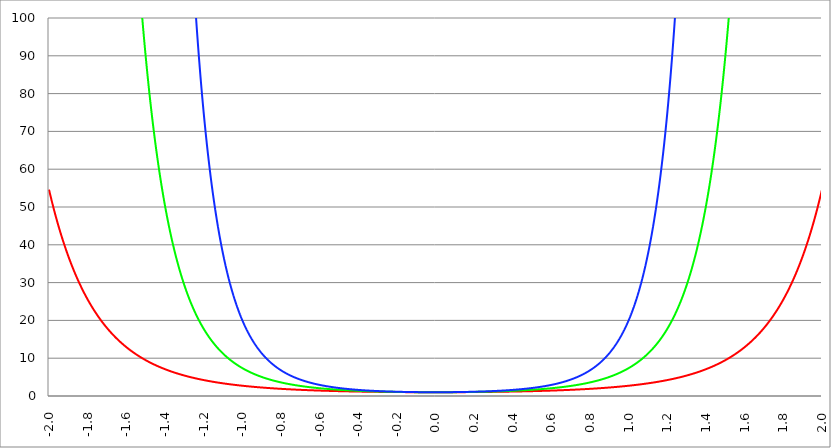
| Category | Series 1 | Series 0 | Series 2 |
|---|---|---|---|
| -2.0 | 54.598 | 2980.958 | 162754.791 |
| -1.998 | 54.163 | 2933.666 | 158897.084 |
| -1.996 | 53.732 | 2887.17 | 155134.537 |
| -1.994 | 53.305 | 2841.456 | 151464.719 |
| -1.992 | 52.882 | 2796.511 | 147885.263 |
| -1.99 | 52.463 | 2752.321 | 144393.862 |
| -1.988 | 52.047 | 2708.873 | 140988.274 |
| -1.986 | 51.635 | 2666.153 | 137666.311 |
| -1.984 | 51.226 | 2624.149 | 134425.847 |
| -1.982 | 50.822 | 2582.848 | 131264.808 |
| -1.98 | 50.421 | 2542.238 | 128181.179 |
| -1.978 | 50.023 | 2502.306 | 125172.993 |
| -1.976 | 49.629 | 2463.041 | 122238.337 |
| -1.974 | 49.239 | 2424.431 | 119375.349 |
| -1.972 | 48.851 | 2386.464 | 116582.214 |
| -1.97 | 48.468 | 2349.129 | 113857.165 |
| -1.968 | 48.088 | 2312.416 | 111198.481 |
| -1.966 | 47.711 | 2276.312 | 108604.487 |
| -1.964 | 47.337 | 2240.808 | 106073.55 |
| -1.962 | 46.967 | 2205.894 | 103604.081 |
| -1.96 | 46.6 | 2171.558 | 101194.532 |
| -1.958 | 46.236 | 2137.79 | 98843.394 |
| -1.956 | 45.876 | 2104.582 | 96549.2 |
| -1.954 | 45.518 | 2071.922 | 94310.518 |
| -1.952 | 45.164 | 2039.802 | 92125.955 |
| -1.95 | 44.813 | 2008.212 | 89994.155 |
| -1.948 | 44.465 | 1977.143 | 87913.794 |
| -1.946 | 44.12 | 1946.585 | 85883.585 |
| -1.944 | 43.778 | 1916.531 | 83902.274 |
| -1.942 | 43.439 | 1886.971 | 81968.639 |
| -1.94 | 43.103 | 1857.896 | 80081.488 |
| -1.938 | 42.77 | 1829.299 | 78239.663 |
| -1.936 | 42.44 | 1801.17 | 76442.033 |
| -1.934 | 42.113 | 1773.503 | 74687.498 |
| -1.932 | 41.789 | 1746.289 | 72974.986 |
| -1.93 | 41.467 | 1719.519 | 71303.451 |
| -1.928 | 41.148 | 1693.187 | 69671.875 |
| -1.926 | 40.832 | 1667.285 | 68079.267 |
| -1.924 | 40.519 | 1641.806 | 66524.661 |
| -1.922 | 40.209 | 1616.742 | 65007.115 |
| -1.92 | 39.901 | 1592.085 | 63525.711 |
| -1.918 | 39.596 | 1567.83 | 62079.556 |
| -1.916 | 39.293 | 1543.97 | 60667.778 |
| -1.914 | 38.994 | 1520.496 | 59289.529 |
| -1.912 | 38.696 | 1497.404 | 57943.982 |
| -1.91 | 38.402 | 1474.685 | 56630.331 |
| -1.908 | 38.11 | 1452.335 | 55347.789 |
| -1.906 | 37.82 | 1430.346 | 54095.593 |
| -1.904 | 37.533 | 1408.713 | 52872.995 |
| -1.902 | 37.248 | 1387.429 | 51679.269 |
| -1.9 | 36.966 | 1366.489 | 50513.707 |
| -1.898 | 36.686 | 1345.886 | 49375.617 |
| -1.896 | 36.409 | 1325.615 | 48264.327 |
| -1.894 | 36.134 | 1305.671 | 47179.181 |
| -1.892 | 35.861 | 1286.046 | 46119.54 |
| -1.89 | 35.591 | 1266.738 | 45084.78 |
| -1.888 | 35.323 | 1247.739 | 44074.294 |
| -1.886 | 35.058 | 1229.044 | 43087.491 |
| -1.884 | 34.794 | 1210.649 | 42123.792 |
| -1.882 | 34.533 | 1192.549 | 41182.636 |
| -1.88 | 34.274 | 1174.738 | 40263.475 |
| -1.878 | 34.018 | 1157.211 | 39365.773 |
| -1.876 | 33.763 | 1139.964 | 38489.009 |
| -1.874 | 33.511 | 1122.992 | 37632.676 |
| -1.872 | 33.261 | 1106.291 | 36796.279 |
| -1.87 | 33.013 | 1089.855 | 35979.334 |
| -1.868 | 32.767 | 1073.681 | 35181.371 |
| -1.866 | 32.523 | 1057.763 | 34401.932 |
| -1.864 | 32.282 | 1042.099 | 33640.568 |
| -1.862 | 32.042 | 1026.682 | 32896.844 |
| -1.86 | 31.804 | 1011.51 | 32170.334 |
| -1.858 | 31.569 | 996.579 | 31460.624 |
| -1.856 | 31.335 | 981.883 | 30767.309 |
| -1.854 | 31.103 | 967.419 | 30089.995 |
| -1.852 | 30.874 | 953.184 | 29428.298 |
| -1.85 | 30.646 | 939.173 | 28781.843 |
| -1.848 | 30.42 | 925.383 | 28150.264 |
| -1.846 | 30.196 | 911.81 | 27533.205 |
| -1.844 | 29.974 | 898.451 | 26930.318 |
| -1.842 | 29.754 | 885.301 | 26341.265 |
| -1.84 | 29.536 | 872.358 | 25765.715 |
| -1.838 | 29.319 | 859.618 | 25203.345 |
| -1.836 | 29.105 | 847.077 | 24653.841 |
| -1.834 | 28.892 | 834.733 | 24116.897 |
| -1.832 | 28.681 | 822.582 | 23592.213 |
| -1.83 | 28.471 | 810.62 | 23079.499 |
| -1.828 | 28.264 | 798.846 | 22578.468 |
| -1.826 | 28.058 | 787.255 | 22088.845 |
| -1.824 | 27.854 | 775.844 | 21610.358 |
| -1.822 | 27.652 | 764.612 | 21142.743 |
| -1.82 | 27.451 | 753.553 | 20685.743 |
| -1.818 | 27.252 | 742.667 | 20239.107 |
| -1.816 | 27.055 | 731.95 | 19802.59 |
| -1.814 | 26.859 | 721.399 | 19375.952 |
| -1.812 | 26.665 | 711.011 | 18958.961 |
| -1.81 | 26.472 | 700.784 | 18551.39 |
| -1.808 | 26.281 | 690.715 | 18153.016 |
| -1.806 | 26.092 | 680.802 | 17763.623 |
| -1.804 | 25.904 | 671.042 | 17383 |
| -1.802 | 25.718 | 661.433 | 17010.941 |
| -1.8 | 25.534 | 651.971 | 16647.245 |
| -1.798 | 25.351 | 642.655 | 16291.715 |
| -1.796 | 25.169 | 633.482 | 15944.162 |
| -1.794 | 24.989 | 624.45 | 15604.397 |
| -1.792 | 24.81 | 615.557 | 15272.239 |
| -1.79 | 24.633 | 606.8 | 14947.51 |
| -1.788 | 24.458 | 598.178 | 14630.037 |
| -1.786 | 24.283 | 589.687 | 14319.65 |
| -1.784 | 24.111 | 581.326 | 14016.185 |
| -1.782 | 23.939 | 573.093 | 13719.48 |
| -1.78 | 23.769 | 564.985 | 13429.378 |
| -1.778 | 23.601 | 557.002 | 13145.726 |
| -1.776 | 23.434 | 549.139 | 12868.375 |
| -1.774 | 23.268 | 541.397 | 12597.177 |
| -1.772 | 23.103 | 533.772 | 12331.99 |
| -1.77 | 22.94 | 526.262 | 12072.676 |
| -1.768 | 22.779 | 518.867 | 11819.098 |
| -1.766 | 22.618 | 511.584 | 11571.124 |
| -1.764 | 22.459 | 504.411 | 11328.625 |
| -1.762 | 22.301 | 497.347 | 11091.474 |
| -1.76 | 22.145 | 490.39 | 10859.548 |
| -1.758 | 21.989 | 483.537 | 10632.727 |
| -1.756 | 21.835 | 476.788 | 10410.894 |
| -1.754 | 21.683 | 470.141 | 10193.933 |
| -1.752 | 21.531 | 463.593 | 9981.733 |
| -1.75 | 21.381 | 457.145 | 9774.185 |
| -1.748 | 21.232 | 450.793 | 9571.182 |
| -1.746 | 21.084 | 444.536 | 9372.62 |
| -1.744 | 20.937 | 438.374 | 9178.398 |
| -1.742 | 20.792 | 432.304 | 8988.417 |
| -1.74 | 20.648 | 426.324 | 8802.579 |
| -1.738 | 20.504 | 420.434 | 8620.79 |
| -1.736 | 20.363 | 414.632 | 8442.958 |
| -1.734 | 20.222 | 408.917 | 8268.993 |
| -1.732 | 20.082 | 403.287 | 8098.807 |
| -1.73 | 19.943 | 397.741 | 7932.313 |
| -1.728 | 19.806 | 392.277 | 7769.429 |
| -1.726 | 19.67 | 386.894 | 7610.073 |
| -1.724 | 19.534 | 381.592 | 7454.163 |
| -1.722 | 19.4 | 376.368 | 7301.624 |
| -1.72 | 19.267 | 371.222 | 7152.377 |
| -1.718 | 19.135 | 366.152 | 7006.349 |
| -1.716 | 19.004 | 361.157 | 6863.467 |
| -1.714 | 18.874 | 356.235 | 6723.66 |
| -1.712 | 18.745 | 351.387 | 6586.86 |
| -1.71 | 18.617 | 346.61 | 6452.997 |
| -1.708 | 18.491 | 341.903 | 6322.007 |
| -1.706 | 18.365 | 337.266 | 6193.824 |
| -1.704 | 18.24 | 332.697 | 6068.386 |
| -1.702 | 18.116 | 328.195 | 5945.631 |
| -1.7 | 17.993 | 323.759 | 5825.499 |
| -1.698 | 17.871 | 319.388 | 5707.932 |
| -1.696 | 17.751 | 315.082 | 5592.871 |
| -1.694 | 17.631 | 310.838 | 5480.261 |
| -1.692 | 17.512 | 306.656 | 5370.047 |
| -1.69 | 17.394 | 302.536 | 5262.176 |
| -1.688 | 17.276 | 298.476 | 5156.596 |
| -1.686 | 17.16 | 294.474 | 5053.256 |
| -1.684 | 17.045 | 290.531 | 4952.105 |
| -1.682 | 16.931 | 286.646 | 4853.095 |
| -1.68 | 16.817 | 282.817 | 4756.18 |
| -1.678 | 16.705 | 279.044 | 4661.311 |
| -1.676 | 16.593 | 275.325 | 4568.444 |
| -1.674 | 16.482 | 271.66 | 4477.535 |
| -1.672 | 16.372 | 268.049 | 4388.541 |
| -1.67 | 16.263 | 264.489 | 4301.418 |
| -1.668 | 16.155 | 260.981 | 4216.126 |
| -1.666 | 16.048 | 257.524 | 4132.625 |
| -1.664 | 15.941 | 254.116 | 4050.874 |
| -1.662 | 15.835 | 250.758 | 3970.836 |
| -1.66 | 15.73 | 247.448 | 3892.473 |
| -1.658 | 15.626 | 244.185 | 3815.748 |
| -1.656 | 15.523 | 240.97 | 3740.625 |
| -1.654 | 15.421 | 237.8 | 3667.069 |
| -1.652 | 15.319 | 234.677 | 3595.046 |
| -1.65 | 15.218 | 231.597 | 3524.522 |
| -1.648 | 15.118 | 228.562 | 3455.464 |
| -1.646 | 15.019 | 225.57 | 3387.841 |
| -1.644 | 14.92 | 222.621 | 3321.62 |
| -1.642 | 14.823 | 219.714 | 3256.773 |
| -1.64 | 14.726 | 216.849 | 3193.268 |
| -1.638 | 14.63 | 214.024 | 3131.076 |
| -1.636 | 14.534 | 211.239 | 3070.169 |
| -1.634 | 14.439 | 208.494 | 3010.52 |
| -1.632 | 14.345 | 205.788 | 2952.1 |
| -1.63 | 14.252 | 203.121 | 2894.883 |
| -1.628 | 14.159 | 200.491 | 2838.843 |
| -1.626 | 14.068 | 197.898 | 2783.955 |
| -1.624 | 13.976 | 195.342 | 2730.194 |
| -1.622 | 13.886 | 192.822 | 2677.535 |
| -1.62 | 13.796 | 190.338 | 2625.955 |
| -1.618 | 13.707 | 187.888 | 2575.431 |
| -1.616 | 13.619 | 185.473 | 2525.939 |
| -1.614 | 13.531 | 183.093 | 2477.457 |
| -1.612 | 13.444 | 180.745 | 2429.965 |
| -1.61 | 13.358 | 178.431 | 2383.44 |
| -1.608 | 13.272 | 176.149 | 2337.862 |
| -1.606 | 13.187 | 173.899 | 2293.21 |
| -1.604 | 13.103 | 171.68 | 2249.466 |
| -1.602 | 13.019 | 169.492 | 2206.608 |
| -1.6 | 12.936 | 167.335 | 2164.62 |
| -1.598 | 12.853 | 165.208 | 2123.481 |
| -1.596 | 12.771 | 163.111 | 2083.174 |
| -1.594 | 12.69 | 161.043 | 2043.681 |
| -1.592 | 12.61 | 159.004 | 2004.985 |
| -1.59 | 12.53 | 156.993 | 1967.069 |
| -1.588 | 12.45 | 155.01 | 1929.916 |
| -1.586 | 12.372 | 153.054 | 1893.511 |
| -1.584 | 12.293 | 151.126 | 1857.837 |
| -1.582 | 12.216 | 149.224 | 1822.878 |
| -1.58 | 12.139 | 147.348 | 1788.621 |
| -1.578 | 12.062 | 145.499 | 1755.049 |
| -1.576 | 11.986 | 143.675 | 1722.149 |
| -1.574 | 11.911 | 141.876 | 1689.906 |
| -1.572 | 11.836 | 140.102 | 1658.306 |
| -1.57 | 11.762 | 138.352 | 1627.337 |
| -1.568 | 11.689 | 136.626 | 1596.984 |
| -1.566 | 11.616 | 134.924 | 1567.235 |
| -1.564 | 11.543 | 133.245 | 1538.077 |
| -1.562 | 11.471 | 131.59 | 1509.497 |
| -1.56 | 11.4 | 129.957 | 1481.485 |
| -1.558 | 11.329 | 128.346 | 1454.027 |
| -1.556 | 11.259 | 126.757 | 1427.112 |
| -1.554 | 11.189 | 125.19 | 1400.729 |
| -1.552 | 11.12 | 123.644 | 1374.867 |
| -1.55 | 11.051 | 122.119 | 1349.514 |
| -1.548 | 10.983 | 120.616 | 1324.661 |
| -1.546 | 10.915 | 119.132 | 1300.297 |
| -1.544 | 10.848 | 117.669 | 1276.412 |
| -1.542 | 10.781 | 116.225 | 1252.995 |
| -1.54 | 10.715 | 114.801 | 1230.038 |
| -1.538 | 10.649 | 113.396 | 1207.53 |
| -1.536 | 10.583 | 112.01 | 1185.462 |
| -1.534 | 10.519 | 110.643 | 1163.826 |
| -1.532 | 10.454 | 109.295 | 1142.612 |
| -1.53 | 10.391 | 107.964 | 1121.811 |
| -1.528 | 10.327 | 106.652 | 1101.416 |
| -1.526 | 10.264 | 105.357 | 1081.418 |
| -1.524 | 10.202 | 104.079 | 1061.808 |
| -1.522 | 10.14 | 102.819 | 1042.578 |
| -1.52 | 10.078 | 101.575 | 1023.722 |
| -1.518 | 10.017 | 100.348 | 1005.23 |
| -1.516 | 9.957 | 99.138 | 987.097 |
| -1.514 | 9.897 | 97.944 | 969.313 |
| -1.512 | 9.837 | 96.765 | 951.873 |
| -1.51 | 9.778 | 95.603 | 934.77 |
| -1.508 | 9.719 | 94.455 | 917.995 |
| -1.506 | 9.66 | 93.324 | 901.543 |
| -1.504 | 9.602 | 92.207 | 885.408 |
| -1.502 | 9.545 | 91.105 | 869.581 |
| -1.5 | 9.488 | 90.017 | 854.059 |
| -1.498 | 9.431 | 88.944 | 838.833 |
| -1.496 | 9.375 | 87.885 | 823.899 |
| -1.494 | 9.319 | 86.84 | 809.25 |
| -1.492 | 9.263 | 85.809 | 794.881 |
| -1.49 | 9.208 | 84.792 | 780.785 |
| -1.488 | 9.154 | 83.788 | 766.958 |
| -1.486 | 9.099 | 82.797 | 753.394 |
| -1.484 | 9.045 | 81.819 | 740.087 |
| -1.482 | 8.992 | 80.854 | 727.033 |
| -1.48 | 8.939 | 79.902 | 714.226 |
| -1.478 | 8.886 | 78.962 | 701.662 |
| -1.476 | 8.834 | 78.035 | 689.335 |
| -1.474 | 8.782 | 77.119 | 677.242 |
| -1.472 | 8.73 | 76.216 | 665.376 |
| -1.469999999999999 | 8.679 | 75.324 | 653.734 |
| -1.467999999999999 | 8.628 | 74.444 | 642.311 |
| -1.465999999999999 | 8.578 | 73.575 | 631.102 |
| -1.463999999999999 | 8.527 | 72.718 | 620.104 |
| -1.461999999999999 | 8.478 | 71.872 | 609.313 |
| -1.459999999999999 | 8.428 | 71.037 | 598.724 |
| -1.457999999999999 | 8.379 | 70.213 | 588.332 |
| -1.455999999999999 | 8.331 | 69.399 | 578.135 |
| -1.453999999999999 | 8.282 | 68.596 | 568.129 |
| -1.451999999999999 | 8.234 | 67.803 | 558.309 |
| -1.449999999999999 | 8.187 | 67.021 | 548.672 |
| -1.447999999999999 | 8.139 | 66.248 | 539.214 |
| -1.445999999999999 | 8.092 | 65.486 | 529.932 |
| -1.443999999999999 | 8.046 | 64.733 | 520.822 |
| -1.441999999999999 | 7.999 | 63.99 | 511.881 |
| -1.439999999999999 | 7.953 | 63.257 | 503.106 |
| -1.437999999999999 | 7.908 | 62.533 | 494.493 |
| -1.435999999999999 | 7.862 | 61.818 | 486.039 |
| -1.433999999999999 | 7.817 | 61.112 | 477.741 |
| -1.431999999999999 | 7.773 | 60.416 | 469.596 |
| -1.429999999999999 | 7.728 | 59.728 | 461.601 |
| -1.427999999999999 | 7.684 | 59.049 | 453.753 |
| -1.425999999999999 | 7.641 | 58.379 | 446.049 |
| -1.423999999999999 | 7.597 | 57.717 | 438.486 |
| -1.421999999999999 | 7.554 | 57.064 | 431.062 |
| -1.419999999999999 | 7.511 | 56.419 | 423.774 |
| -1.417999999999999 | 7.469 | 55.782 | 416.619 |
| -1.415999999999999 | 7.427 | 55.153 | 409.595 |
| -1.413999999999999 | 7.385 | 54.532 | 402.698 |
| -1.411999999999999 | 7.343 | 53.919 | 395.928 |
| -1.409999999999999 | 7.302 | 53.314 | 389.28 |
| -1.407999999999999 | 7.261 | 52.716 | 382.754 |
| -1.405999999999999 | 7.22 | 52.126 | 376.346 |
| -1.403999999999999 | 7.179 | 51.544 | 370.054 |
| -1.401999999999999 | 7.139 | 50.969 | 363.876 |
| -1.399999999999999 | 7.099 | 50.4 | 357.809 |
| -1.397999999999999 | 7.06 | 49.84 | 351.852 |
| -1.395999999999999 | 7.02 | 49.286 | 346.003 |
| -1.393999999999999 | 6.981 | 48.739 | 340.259 |
| -1.391999999999999 | 6.943 | 48.199 | 334.619 |
| -1.389999999999999 | 6.904 | 47.665 | 329.08 |
| -1.387999999999999 | 6.866 | 47.138 | 323.64 |
| -1.385999999999999 | 6.828 | 46.618 | 318.298 |
| -1.383999999999999 | 6.79 | 46.105 | 313.052 |
| -1.381999999999999 | 6.753 | 45.597 | 307.899 |
| -1.379999999999999 | 6.715 | 45.096 | 302.839 |
| -1.377999999999999 | 6.678 | 44.602 | 297.868 |
| -1.375999999999999 | 6.642 | 44.113 | 292.987 |
| -1.373999999999999 | 6.605 | 43.63 | 288.192 |
| -1.371999999999999 | 6.569 | 43.154 | 283.483 |
| -1.369999999999999 | 6.533 | 42.683 | 278.857 |
| -1.367999999999999 | 6.498 | 42.218 | 274.314 |
| -1.365999999999999 | 6.462 | 41.759 | 269.85 |
| -1.363999999999999 | 6.427 | 41.305 | 265.466 |
| -1.361999999999999 | 6.392 | 40.857 | 261.16 |
| -1.359999999999999 | 6.357 | 40.415 | 256.929 |
| -1.357999999999999 | 6.323 | 39.978 | 252.773 |
| -1.355999999999999 | 6.289 | 39.546 | 248.69 |
| -1.353999999999999 | 6.255 | 39.12 | 244.679 |
| -1.351999999999999 | 6.221 | 38.699 | 240.739 |
| -1.349999999999999 | 6.187 | 38.283 | 236.867 |
| -1.347999999999999 | 6.154 | 37.872 | 233.064 |
| -1.345999999999999 | 6.121 | 37.466 | 229.327 |
| -1.343999999999999 | 6.088 | 37.065 | 225.655 |
| -1.341999999999999 | 6.055 | 36.669 | 222.048 |
| -1.339999999999999 | 6.023 | 36.278 | 218.503 |
| -1.337999999999999 | 5.991 | 35.891 | 215.02 |
| -1.335999999999999 | 5.959 | 35.509 | 211.598 |
| -1.333999999999999 | 5.927 | 35.132 | 208.235 |
| -1.331999999999999 | 5.896 | 34.759 | 204.931 |
| -1.329999999999999 | 5.864 | 34.391 | 201.684 |
| -1.327999999999999 | 5.833 | 34.027 | 198.493 |
| -1.325999999999999 | 5.802 | 33.668 | 195.357 |
| -1.323999999999999 | 5.772 | 33.313 | 192.275 |
| -1.321999999999999 | 5.741 | 32.962 | 189.247 |
| -1.319999999999999 | 5.711 | 32.616 | 186.271 |
| -1.317999999999999 | 5.681 | 32.274 | 183.345 |
| -1.315999999999999 | 5.651 | 31.935 | 180.471 |
| -1.313999999999999 | 5.621 | 31.601 | 177.645 |
| -1.311999999999999 | 5.592 | 31.271 | 174.868 |
| -1.309999999999999 | 5.563 | 30.945 | 172.139 |
| -1.307999999999999 | 5.534 | 30.622 | 169.456 |
| -1.305999999999999 | 5.505 | 30.304 | 166.819 |
| -1.303999999999999 | 5.476 | 29.989 | 164.227 |
| -1.301999999999999 | 5.448 | 29.678 | 161.679 |
| -1.299999999999999 | 5.419 | 29.371 | 159.174 |
| -1.297999999999999 | 5.391 | 29.067 | 156.712 |
| -1.295999999999999 | 5.363 | 28.767 | 154.292 |
| -1.293999999999999 | 5.336 | 28.471 | 151.913 |
| -1.291999999999999 | 5.308 | 28.178 | 149.574 |
| -1.289999999999999 | 5.281 | 27.888 | 147.275 |
| -1.287999999999999 | 5.254 | 27.602 | 145.014 |
| -1.285999999999999 | 5.227 | 27.319 | 142.792 |
| -1.283999999999999 | 5.2 | 27.04 | 140.607 |
| -1.281999999999999 | 5.173 | 26.764 | 138.459 |
| -1.279999999999999 | 5.147 | 26.491 | 136.347 |
| -1.277999999999999 | 5.121 | 26.221 | 134.27 |
| -1.275999999999999 | 5.095 | 25.955 | 132.228 |
| -1.273999999999999 | 5.069 | 25.691 | 130.22 |
| -1.271999999999999 | 5.043 | 25.431 | 128.246 |
| -1.269999999999999 | 5.017 | 25.174 | 126.305 |
| -1.267999999999999 | 4.992 | 24.919 | 124.396 |
| -1.265999999999999 | 4.967 | 24.668 | 122.519 |
| -1.263999999999999 | 4.942 | 24.42 | 120.673 |
| -1.261999999999999 | 4.917 | 24.174 | 118.858 |
| -1.259999999999999 | 4.892 | 23.932 | 117.073 |
| -1.257999999999999 | 4.867 | 23.692 | 115.318 |
| -1.255999999999999 | 4.843 | 23.455 | 113.591 |
| -1.253999999999999 | 4.819 | 23.22 | 111.894 |
| -1.251999999999999 | 4.795 | 22.989 | 110.224 |
| -1.249999999999999 | 4.771 | 22.76 | 108.581 |
| -1.247999999999999 | 4.747 | 22.534 | 106.966 |
| -1.245999999999999 | 4.723 | 22.31 | 105.377 |
| -1.243999999999999 | 4.7 | 22.089 | 103.815 |
| -1.241999999999999 | 4.677 | 21.87 | 102.278 |
| -1.239999999999999 | 4.653 | 21.654 | 100.766 |
| -1.237999999999999 | 4.63 | 21.441 | 99.279 |
| -1.235999999999999 | 4.608 | 21.23 | 97.816 |
| -1.233999999999999 | 4.585 | 21.021 | 96.377 |
| -1.231999999999999 | 4.562 | 20.814 | 94.962 |
| -1.229999999999999 | 4.54 | 20.61 | 93.569 |
| -1.227999999999999 | 4.518 | 20.409 | 92.199 |
| -1.225999999999999 | 4.495 | 20.209 | 90.852 |
| -1.223999999999999 | 4.474 | 20.012 | 89.526 |
| -1.221999999999999 | 4.452 | 19.818 | 88.222 |
| -1.219999999999999 | 4.43 | 19.625 | 86.938 |
| -1.217999999999999 | 4.408 | 19.434 | 85.676 |
| -1.215999999999999 | 4.387 | 19.246 | 84.434 |
| -1.213999999999999 | 4.366 | 19.06 | 83.212 |
| -1.211999999999999 | 4.345 | 18.876 | 82.009 |
| -1.209999999999999 | 4.324 | 18.694 | 80.826 |
| -1.207999999999999 | 4.303 | 18.514 | 79.662 |
| -1.205999999999999 | 4.282 | 18.336 | 78.516 |
| -1.203999999999999 | 4.261 | 18.16 | 77.389 |
| -1.201999999999999 | 4.241 | 17.986 | 76.28 |
| -1.199999999999999 | 4.221 | 17.814 | 75.189 |
| -1.197999999999999 | 4.201 | 17.644 | 74.115 |
| -1.195999999999999 | 4.18 | 17.476 | 73.058 |
| -1.193999999999999 | 4.161 | 17.31 | 72.017 |
| -1.191999999999999 | 4.141 | 17.145 | 70.994 |
| -1.189999999999999 | 4.121 | 16.983 | 69.986 |
| -1.187999999999999 | 4.101 | 16.822 | 68.995 |
| -1.185999999999999 | 4.082 | 16.663 | 68.019 |
| -1.183999999999999 | 4.063 | 16.506 | 67.059 |
| -1.181999999999999 | 4.044 | 16.35 | 66.113 |
| -1.179999999999999 | 4.024 | 16.197 | 65.183 |
| -1.177999999999999 | 4.006 | 16.045 | 64.267 |
| -1.175999999999999 | 3.987 | 15.894 | 63.366 |
| -1.173999999999999 | 3.968 | 15.745 | 62.479 |
| -1.171999999999999 | 3.949 | 15.598 | 61.606 |
| -1.169999999999999 | 3.931 | 15.453 | 60.746 |
| -1.167999999999999 | 3.913 | 15.309 | 59.9 |
| -1.165999999999999 | 3.894 | 15.167 | 59.067 |
| -1.163999999999999 | 3.876 | 15.026 | 58.247 |
| -1.161999999999999 | 3.858 | 14.887 | 57.439 |
| -1.159999999999999 | 3.84 | 14.749 | 56.645 |
| -1.157999999999999 | 3.823 | 14.613 | 55.862 |
| -1.155999999999999 | 3.805 | 14.479 | 55.092 |
| -1.153999999999999 | 3.788 | 14.345 | 54.334 |
| -1.151999999999999 | 3.77 | 14.214 | 53.587 |
| -1.149999999999999 | 3.753 | 14.083 | 52.852 |
| -1.147999999999999 | 3.736 | 13.955 | 52.129 |
| -1.145999999999999 | 3.718 | 13.827 | 51.416 |
| -1.143999999999999 | 3.701 | 13.701 | 50.714 |
| -1.141999999999999 | 3.685 | 13.576 | 50.023 |
| -1.139999999999999 | 3.668 | 13.453 | 49.343 |
| -1.137999999999999 | 3.651 | 13.331 | 48.673 |
| -1.135999999999999 | 3.635 | 13.21 | 48.014 |
| -1.133999999999999 | 3.618 | 13.091 | 47.364 |
| -1.131999999999999 | 3.602 | 12.973 | 46.725 |
| -1.129999999999999 | 3.586 | 12.856 | 46.095 |
| -1.127999999999999 | 3.569 | 12.74 | 45.475 |
| -1.125999999999999 | 3.553 | 12.626 | 44.864 |
| -1.123999999999999 | 3.537 | 12.513 | 44.262 |
| -1.121999999999999 | 3.521 | 12.401 | 43.67 |
| -1.119999999999999 | 3.506 | 12.29 | 43.086 |
| -1.117999999999999 | 3.49 | 12.181 | 42.511 |
| -1.115999999999999 | 3.475 | 12.072 | 41.945 |
| -1.113999999999999 | 3.459 | 11.965 | 41.388 |
| -1.111999999999999 | 3.444 | 11.859 | 40.839 |
| -1.109999999999999 | 3.428 | 11.754 | 40.298 |
| -1.107999999999999 | 3.413 | 11.65 | 39.765 |
| -1.105999999999999 | 3.398 | 11.548 | 39.24 |
| -1.103999999999999 | 3.383 | 11.446 | 38.724 |
| -1.101999999999999 | 3.368 | 11.345 | 38.214 |
| -1.099999999999999 | 3.353 | 11.246 | 37.713 |
| -1.097999999999999 | 3.339 | 11.147 | 37.219 |
| -1.095999999999999 | 3.324 | 11.05 | 36.732 |
| -1.093999999999999 | 3.31 | 10.954 | 36.252 |
| -1.091999999999999 | 3.295 | 10.858 | 35.78 |
| -1.089999999999999 | 3.281 | 10.764 | 35.315 |
| -1.087999999999999 | 3.267 | 10.671 | 34.856 |
| -1.085999999999999 | 3.252 | 10.578 | 34.405 |
| -1.083999999999999 | 3.238 | 10.487 | 33.959 |
| -1.081999999999999 | 3.224 | 10.396 | 33.521 |
| -1.079999999999999 | 3.21 | 10.307 | 33.089 |
| -1.077999999999999 | 3.197 | 10.218 | 32.663 |
| -1.075999999999999 | 3.183 | 10.131 | 32.244 |
| -1.073999999999999 | 3.169 | 10.044 | 31.831 |
| -1.071999999999999 | 3.156 | 9.958 | 31.423 |
| -1.069999999999999 | 3.142 | 9.873 | 31.022 |
| -1.067999999999999 | 3.129 | 9.789 | 30.627 |
| -1.065999999999999 | 3.115 | 9.706 | 30.237 |
| -1.063999999999999 | 3.102 | 9.623 | 29.853 |
| -1.061999999999999 | 3.089 | 9.542 | 29.475 |
| -1.059999999999999 | 3.076 | 9.461 | 29.102 |
| -1.057999999999999 | 3.063 | 9.381 | 28.734 |
| -1.055999999999999 | 3.05 | 9.302 | 28.372 |
| -1.053999999999999 | 3.037 | 9.224 | 28.015 |
| -1.051999999999999 | 3.024 | 9.147 | 27.663 |
| -1.049999999999999 | 3.012 | 9.07 | 27.317 |
| -1.047999999999999 | 2.999 | 8.994 | 26.975 |
| -1.045999999999999 | 2.987 | 8.919 | 26.638 |
| -1.043999999999999 | 2.974 | 8.845 | 26.306 |
| -1.041999999999999 | 2.962 | 8.772 | 25.979 |
| -1.039999999999999 | 2.949 | 8.699 | 25.657 |
| -1.037999999999999 | 2.937 | 8.627 | 25.339 |
| -1.035999999999999 | 2.925 | 8.556 | 25.025 |
| -1.033999999999999 | 2.913 | 8.485 | 24.716 |
| -1.031999999999999 | 2.901 | 8.415 | 24.412 |
| -1.029999999999999 | 2.889 | 8.346 | 24.112 |
| -1.027999999999999 | 2.877 | 8.278 | 23.816 |
| -1.025999999999999 | 2.865 | 8.21 | 23.524 |
| -1.023999999999999 | 2.854 | 8.143 | 23.237 |
| -1.021999999999999 | 2.842 | 8.077 | 22.953 |
| -1.019999999999999 | 2.83 | 8.011 | 22.674 |
| -1.017999999999999 | 2.819 | 7.946 | 22.398 |
| -1.015999999999999 | 2.807 | 7.881 | 22.126 |
| -1.013999999999999 | 2.796 | 7.818 | 21.858 |
| -1.011999999999999 | 2.785 | 7.755 | 21.594 |
| -1.009999999999999 | 2.773 | 7.692 | 21.334 |
| -1.007999999999999 | 2.762 | 7.63 | 21.077 |
| -1.005999999999999 | 2.751 | 7.569 | 20.824 |
| -1.003999999999999 | 2.74 | 7.508 | 20.574 |
| -1.001999999999999 | 2.729 | 7.448 | 20.328 |
| -0.999999999999999 | 2.718 | 7.389 | 20.086 |
| -0.997999999999999 | 2.707 | 7.33 | 19.846 |
| -0.995999999999999 | 2.697 | 7.272 | 19.61 |
| -0.993999999999999 | 2.686 | 7.214 | 19.377 |
| -0.991999999999999 | 2.675 | 7.157 | 19.148 |
| -0.989999999999999 | 2.665 | 7.101 | 18.922 |
| -0.987999999999999 | 2.654 | 7.045 | 18.698 |
| -0.985999999999999 | 2.644 | 6.989 | 18.478 |
| -0.983999999999999 | 2.633 | 6.935 | 18.261 |
| -0.981999999999999 | 2.623 | 6.88 | 18.047 |
| -0.979999999999999 | 2.613 | 6.826 | 17.836 |
| -0.977999999999999 | 2.603 | 6.773 | 17.627 |
| -0.975999999999999 | 2.592 | 6.72 | 17.422 |
| -0.973999999999999 | 2.582 | 6.668 | 17.219 |
| -0.971999999999999 | 2.572 | 6.617 | 17.019 |
| -0.969999999999999 | 2.562 | 6.565 | 16.822 |
| -0.967999999999999 | 2.552 | 6.515 | 16.628 |
| -0.965999999999999 | 2.543 | 6.464 | 16.436 |
| -0.963999999999999 | 2.533 | 6.415 | 16.247 |
| -0.961999999999999 | 2.523 | 6.365 | 16.06 |
| -0.959999999999999 | 2.513 | 6.317 | 15.876 |
| -0.957999999999999 | 2.504 | 6.268 | 15.694 |
| -0.955999999999999 | 2.494 | 6.221 | 15.515 |
| -0.953999999999999 | 2.485 | 6.173 | 15.338 |
| -0.951999999999999 | 2.475 | 6.126 | 15.164 |
| -0.949999999999999 | 2.466 | 6.08 | 14.992 |
| -0.947999999999999 | 2.456 | 6.034 | 14.822 |
| -0.945999999999999 | 2.447 | 5.988 | 14.655 |
| -0.943999999999999 | 2.438 | 5.943 | 14.489 |
| -0.941999999999999 | 2.429 | 5.899 | 14.326 |
| -0.939999999999999 | 2.42 | 5.854 | 14.165 |
| -0.937999999999999 | 2.411 | 5.811 | 14.007 |
| -0.935999999999999 | 2.402 | 5.767 | 13.85 |
| -0.933999999999999 | 2.393 | 5.724 | 13.696 |
| -0.931999999999999 | 2.384 | 5.682 | 13.543 |
| -0.929999999999999 | 2.375 | 5.64 | 13.393 |
| -0.927999999999999 | 2.366 | 5.598 | 13.244 |
| -0.925999999999999 | 2.357 | 5.556 | 13.098 |
| -0.923999999999999 | 2.348 | 5.515 | 12.953 |
| -0.921999999999999 | 2.34 | 5.475 | 12.81 |
| -0.919999999999999 | 2.331 | 5.435 | 12.67 |
| -0.917999999999999 | 2.323 | 5.395 | 12.531 |
| -0.915999999999999 | 2.314 | 5.355 | 12.393 |
| -0.913999999999999 | 2.306 | 5.316 | 12.258 |
| -0.911999999999999 | 2.297 | 5.278 | 12.125 |
| -0.909999999999999 | 2.289 | 5.239 | 11.993 |
| -0.907999999999999 | 2.281 | 5.201 | 11.863 |
| -0.905999999999999 | 2.272 | 5.164 | 11.734 |
| -0.903999999999999 | 2.264 | 5.127 | 11.607 |
| -0.901999999999999 | 2.256 | 5.09 | 11.482 |
| -0.899999999999999 | 2.248 | 5.053 | 11.359 |
| -0.897999999999999 | 2.24 | 5.017 | 11.237 |
| -0.895999999999999 | 2.232 | 4.981 | 11.117 |
| -0.893999999999999 | 2.224 | 4.945 | 10.998 |
| -0.891999999999999 | 2.216 | 4.91 | 10.881 |
| -0.889999999999999 | 2.208 | 4.875 | 10.765 |
| -0.887999999999999 | 2.2 | 4.841 | 10.651 |
| -0.885999999999999 | 2.192 | 4.807 | 10.538 |
| -0.883999999999999 | 2.185 | 4.773 | 10.427 |
| -0.881999999999999 | 2.177 | 4.739 | 10.317 |
| -0.879999999999999 | 2.169 | 4.706 | 10.208 |
| -0.877999999999999 | 2.162 | 4.673 | 10.101 |
| -0.875999999999999 | 2.154 | 4.64 | 9.995 |
| -0.873999999999999 | 2.147 | 4.608 | 9.891 |
| -0.871999999999999 | 2.139 | 4.576 | 9.788 |
| -0.869999999999999 | 2.132 | 4.544 | 9.686 |
| -0.867999999999999 | 2.124 | 4.512 | 9.586 |
| -0.865999999999999 | 2.117 | 4.481 | 9.486 |
| -0.863999999999999 | 2.11 | 4.45 | 9.389 |
| -0.861999999999999 | 2.102 | 4.42 | 9.292 |
| -0.859999999999999 | 2.095 | 4.389 | 9.196 |
| -0.857999999999999 | 2.088 | 4.359 | 9.102 |
| -0.855999999999999 | 2.081 | 4.33 | 9.009 |
| -0.853999999999999 | 2.074 | 4.3 | 8.917 |
| -0.851999999999999 | 2.067 | 4.271 | 8.826 |
| -0.849999999999999 | 2.06 | 4.242 | 8.736 |
| -0.847999999999999 | 2.053 | 4.213 | 8.648 |
| -0.845999999999999 | 2.046 | 4.185 | 8.56 |
| -0.843999999999999 | 2.039 | 4.156 | 8.474 |
| -0.841999999999999 | 2.032 | 4.129 | 8.389 |
| -0.839999999999999 | 2.025 | 4.101 | 8.305 |
| -0.837999999999999 | 2.018 | 4.073 | 8.221 |
| -0.835999999999999 | 2.012 | 4.046 | 8.139 |
| -0.833999999999999 | 2.005 | 4.019 | 8.058 |
| -0.831999999999999 | 1.998 | 3.993 | 7.978 |
| -0.829999999999999 | 1.992 | 3.966 | 7.899 |
| -0.827999999999999 | 1.985 | 3.94 | 7.821 |
| -0.825999999999999 | 1.978 | 3.914 | 7.743 |
| -0.823999999999999 | 1.972 | 3.888 | 7.667 |
| -0.821999999999999 | 1.965 | 3.863 | 7.592 |
| -0.819999999999999 | 1.959 | 3.837 | 7.517 |
| -0.817999999999999 | 1.953 | 3.812 | 7.444 |
| -0.815999999999999 | 1.946 | 3.788 | 7.371 |
| -0.813999999999999 | 1.94 | 3.763 | 7.299 |
| -0.811999999999999 | 1.934 | 3.739 | 7.229 |
| -0.809999999999999 | 1.927 | 3.714 | 7.158 |
| -0.807999999999999 | 1.921 | 3.69 | 7.089 |
| -0.805999999999999 | 1.915 | 3.667 | 7.021 |
| -0.803999999999999 | 1.909 | 3.643 | 6.954 |
| -0.801999999999999 | 1.903 | 3.62 | 6.887 |
| -0.799999999999999 | 1.896 | 3.597 | 6.821 |
| -0.797999999999999 | 1.89 | 3.574 | 6.756 |
| -0.795999999999999 | 1.884 | 3.551 | 6.692 |
| -0.793999999999999 | 1.878 | 3.528 | 6.628 |
| -0.791999999999999 | 1.872 | 3.506 | 6.565 |
| -0.789999999999999 | 1.867 | 3.484 | 6.503 |
| -0.787999999999999 | 1.861 | 3.462 | 6.442 |
| -0.785999999999999 | 1.855 | 3.44 | 6.381 |
| -0.783999999999999 | 1.849 | 3.419 | 6.322 |
| -0.781999999999999 | 1.843 | 3.398 | 6.262 |
| -0.779999999999999 | 1.837 | 3.376 | 6.204 |
| -0.777999999999999 | 1.832 | 3.355 | 6.146 |
| -0.775999999999999 | 1.826 | 3.335 | 6.089 |
| -0.773999999999999 | 1.82 | 3.314 | 6.033 |
| -0.771999999999999 | 1.815 | 3.294 | 5.977 |
| -0.769999999999999 | 1.809 | 3.273 | 5.922 |
| -0.767999999999999 | 1.804 | 3.253 | 5.868 |
| -0.765999999999999 | 1.798 | 3.233 | 5.814 |
| -0.763999999999999 | 1.793 | 3.214 | 5.761 |
| -0.761999999999999 | 1.787 | 3.194 | 5.708 |
| -0.759999999999999 | 1.782 | 3.175 | 5.656 |
| -0.757999999999999 | 1.776 | 3.155 | 5.605 |
| -0.755999999999999 | 1.771 | 3.136 | 5.554 |
| -0.753999999999999 | 1.766 | 3.118 | 5.504 |
| -0.751999999999999 | 1.76 | 3.099 | 5.455 |
| -0.749999999999999 | 1.755 | 3.08 | 5.406 |
| -0.747999999999999 | 1.75 | 3.062 | 5.358 |
| -0.745999999999999 | 1.745 | 3.044 | 5.31 |
| -0.743999999999999 | 1.739 | 3.025 | 5.263 |
| -0.741999999999999 | 1.734 | 3.008 | 5.216 |
| -0.739999999999999 | 1.729 | 2.99 | 5.17 |
| -0.737999999999999 | 1.724 | 2.972 | 5.124 |
| -0.735999999999999 | 1.719 | 2.955 | 5.079 |
| -0.733999999999999 | 1.714 | 2.937 | 5.034 |
| -0.731999999999999 | 1.709 | 2.92 | 4.99 |
| -0.729999999999999 | 1.704 | 2.903 | 4.947 |
| -0.727999999999999 | 1.699 | 2.886 | 4.904 |
| -0.725999999999999 | 1.694 | 2.87 | 4.861 |
| -0.723999999999999 | 1.689 | 2.853 | 4.819 |
| -0.721999999999999 | 1.684 | 2.836 | 4.777 |
| -0.719999999999999 | 1.679 | 2.82 | 4.736 |
| -0.717999999999999 | 1.675 | 2.804 | 4.695 |
| -0.715999999999999 | 1.67 | 2.788 | 4.655 |
| -0.713999999999999 | 1.665 | 2.772 | 4.615 |
| -0.711999999999999 | 1.66 | 2.756 | 4.576 |
| -0.709999999999999 | 1.655 | 2.741 | 4.537 |
| -0.707999999999999 | 1.651 | 2.725 | 4.499 |
| -0.705999999999999 | 1.646 | 2.71 | 4.461 |
| -0.703999999999999 | 1.642 | 2.695 | 4.423 |
| -0.701999999999999 | 1.637 | 2.679 | 4.386 |
| -0.699999999999999 | 1.632 | 2.664 | 4.349 |
| -0.697999999999999 | 1.628 | 2.65 | 4.313 |
| -0.695999999999999 | 1.623 | 2.635 | 4.277 |
| -0.693999999999999 | 1.619 | 2.62 | 4.241 |
| -0.691999999999999 | 1.614 | 2.606 | 4.206 |
| -0.689999999999999 | 1.61 | 2.591 | 4.172 |
| -0.687999999999999 | 1.605 | 2.577 | 4.137 |
| -0.685999999999999 | 1.601 | 2.563 | 4.103 |
| -0.683999999999999 | 1.597 | 2.549 | 4.07 |
| -0.681999999999999 | 1.592 | 2.535 | 4.036 |
| -0.679999999999999 | 1.588 | 2.521 | 4.004 |
| -0.677999999999999 | 1.584 | 2.508 | 3.971 |
| -0.675999999999999 | 1.579 | 2.494 | 3.939 |
| -0.673999999999999 | 1.575 | 2.481 | 3.907 |
| -0.671999999999999 | 1.571 | 2.467 | 3.876 |
| -0.669999999999999 | 1.567 | 2.454 | 3.845 |
| -0.667999999999999 | 1.562 | 2.441 | 3.814 |
| -0.665999999999999 | 1.558 | 2.428 | 3.784 |
| -0.663999999999999 | 1.554 | 2.415 | 3.753 |
| -0.661999999999999 | 1.55 | 2.402 | 3.724 |
| -0.659999999999999 | 1.546 | 2.39 | 3.694 |
| -0.657999999999999 | 1.542 | 2.377 | 3.665 |
| -0.655999999999999 | 1.538 | 2.365 | 3.636 |
| -0.653999999999999 | 1.534 | 2.352 | 3.608 |
| -0.651999999999999 | 1.53 | 2.34 | 3.58 |
| -0.649999999999999 | 1.526 | 2.328 | 3.552 |
| -0.647999999999999 | 1.522 | 2.316 | 3.524 |
| -0.645999999999999 | 1.518 | 2.304 | 3.497 |
| -0.643999999999999 | 1.514 | 2.292 | 3.47 |
| -0.641999999999999 | 1.51 | 2.28 | 3.444 |
| -0.639999999999999 | 1.506 | 2.269 | 3.417 |
| -0.637999999999999 | 1.502 | 2.257 | 3.391 |
| -0.635999999999999 | 1.499 | 2.246 | 3.365 |
| -0.633999999999999 | 1.495 | 2.234 | 3.34 |
| -0.631999999999999 | 1.491 | 2.223 | 3.314 |
| -0.629999999999999 | 1.487 | 2.212 | 3.289 |
| -0.627999999999999 | 1.483 | 2.201 | 3.265 |
| -0.625999999999999 | 1.48 | 2.19 | 3.24 |
| -0.623999999999999 | 1.476 | 2.179 | 3.216 |
| -0.621999999999999 | 1.472 | 2.168 | 3.192 |
| -0.619999999999999 | 1.469 | 2.157 | 3.168 |
| -0.617999999999999 | 1.465 | 2.147 | 3.145 |
| -0.615999999999999 | 1.461 | 2.136 | 3.122 |
| -0.613999999999999 | 1.458 | 2.125 | 3.099 |
| -0.611999999999999 | 1.454 | 2.115 | 3.076 |
| -0.609999999999999 | 1.451 | 2.105 | 3.054 |
| -0.607999999999999 | 1.447 | 2.095 | 3.031 |
| -0.605999999999999 | 1.444 | 2.084 | 3.009 |
| -0.603999999999999 | 1.44 | 2.074 | 2.988 |
| -0.601999999999999 | 1.437 | 2.064 | 2.966 |
| -0.599999999999999 | 1.433 | 2.054 | 2.945 |
| -0.597999999999999 | 1.43 | 2.045 | 2.924 |
| -0.595999999999999 | 1.426 | 2.035 | 2.903 |
| -0.593999999999999 | 1.423 | 2.025 | 2.882 |
| -0.591999999999999 | 1.42 | 2.016 | 2.862 |
| -0.589999999999999 | 1.416 | 2.006 | 2.841 |
| -0.587999999999999 | 1.413 | 1.997 | 2.821 |
| -0.585999999999999 | 1.41 | 1.987 | 2.802 |
| -0.583999999999999 | 1.406 | 1.978 | 2.782 |
| -0.581999999999999 | 1.403 | 1.969 | 2.763 |
| -0.579999999999999 | 1.4 | 1.96 | 2.743 |
| -0.577999999999999 | 1.397 | 1.951 | 2.724 |
| -0.575999999999999 | 1.393 | 1.942 | 2.706 |
| -0.573999999999999 | 1.39 | 1.933 | 2.687 |
| -0.571999999999999 | 1.387 | 1.924 | 2.669 |
| -0.569999999999999 | 1.384 | 1.915 | 2.65 |
| -0.567999999999999 | 1.381 | 1.906 | 2.632 |
| -0.565999999999999 | 1.378 | 1.898 | 2.614 |
| -0.563999999999999 | 1.375 | 1.889 | 2.597 |
| -0.561999999999999 | 1.371 | 1.881 | 2.579 |
| -0.559999999999999 | 1.368 | 1.872 | 2.562 |
| -0.557999999999999 | 1.365 | 1.864 | 2.545 |
| -0.555999999999999 | 1.362 | 1.856 | 2.528 |
| -0.553999999999999 | 1.359 | 1.847 | 2.511 |
| -0.551999999999999 | 1.356 | 1.839 | 2.495 |
| -0.549999999999999 | 1.353 | 1.831 | 2.478 |
| -0.547999999999999 | 1.35 | 1.823 | 2.462 |
| -0.545999999999999 | 1.347 | 1.815 | 2.446 |
| -0.543999999999999 | 1.344 | 1.807 | 2.43 |
| -0.541999999999999 | 1.341 | 1.8 | 2.414 |
| -0.539999999999999 | 1.339 | 1.792 | 2.398 |
| -0.537999999999999 | 1.336 | 1.784 | 2.383 |
| -0.535999999999999 | 1.333 | 1.776 | 2.368 |
| -0.533999999999999 | 1.33 | 1.769 | 2.352 |
| -0.531999999999999 | 1.327 | 1.761 | 2.337 |
| -0.529999999999999 | 1.324 | 1.754 | 2.323 |
| -0.527999999999999 | 1.322 | 1.746 | 2.308 |
| -0.525999999999999 | 1.319 | 1.739 | 2.293 |
| -0.523999999999999 | 1.316 | 1.732 | 2.279 |
| -0.521999999999999 | 1.313 | 1.725 | 2.265 |
| -0.519999999999999 | 1.31 | 1.717 | 2.251 |
| -0.517999999999999 | 1.308 | 1.71 | 2.237 |
| -0.515999999999999 | 1.305 | 1.703 | 2.223 |
| -0.513999999999999 | 1.302 | 1.696 | 2.209 |
| -0.511999999999999 | 1.3 | 1.689 | 2.196 |
| -0.509999999999999 | 1.297 | 1.682 | 2.182 |
| -0.507999999999999 | 1.294 | 1.676 | 2.169 |
| -0.505999999999999 | 1.292 | 1.669 | 2.156 |
| -0.503999999999999 | 1.289 | 1.662 | 2.143 |
| -0.501999999999999 | 1.287 | 1.655 | 2.13 |
| -0.499999999999999 | 1.284 | 1.649 | 2.117 |
| -0.497999999999999 | 1.281 | 1.642 | 2.104 |
| -0.495999999999999 | 1.279 | 1.636 | 2.092 |
| -0.493999999999999 | 1.276 | 1.629 | 2.079 |
| -0.491999999999999 | 1.274 | 1.623 | 2.067 |
| -0.489999999999999 | 1.271 | 1.616 | 2.055 |
| -0.487999999999999 | 1.269 | 1.61 | 2.043 |
| -0.485999999999999 | 1.266 | 1.604 | 2.031 |
| -0.483999999999999 | 1.264 | 1.598 | 2.019 |
| -0.481999999999999 | 1.262 | 1.591 | 2.008 |
| -0.479999999999999 | 1.259 | 1.585 | 1.996 |
| -0.477999999999999 | 1.257 | 1.579 | 1.985 |
| -0.475999999999999 | 1.254 | 1.573 | 1.973 |
| -0.473999999999999 | 1.252 | 1.567 | 1.962 |
| -0.471999999999999 | 1.25 | 1.561 | 1.951 |
| -0.469999999999999 | 1.247 | 1.556 | 1.94 |
| -0.467999999999999 | 1.245 | 1.55 | 1.929 |
| -0.465999999999999 | 1.243 | 1.544 | 1.918 |
| -0.463999999999999 | 1.24 | 1.538 | 1.908 |
| -0.461999999999999 | 1.238 | 1.532 | 1.897 |
| -0.459999999999999 | 1.236 | 1.527 | 1.887 |
| -0.457999999999999 | 1.233 | 1.521 | 1.876 |
| -0.455999999999999 | 1.231 | 1.516 | 1.866 |
| -0.453999999999999 | 1.229 | 1.51 | 1.856 |
| -0.451999999999999 | 1.227 | 1.505 | 1.846 |
| -0.449999999999999 | 1.224 | 1.499 | 1.836 |
| -0.447999999999999 | 1.222 | 1.494 | 1.826 |
| -0.445999999999999 | 1.22 | 1.489 | 1.816 |
| -0.443999999999999 | 1.218 | 1.483 | 1.807 |
| -0.441999999999999 | 1.216 | 1.478 | 1.797 |
| -0.439999999999999 | 1.214 | 1.473 | 1.787 |
| -0.437999999999999 | 1.211 | 1.468 | 1.778 |
| -0.435999999999999 | 1.209 | 1.463 | 1.769 |
| -0.433999999999999 | 1.207 | 1.457 | 1.76 |
| -0.431999999999999 | 1.205 | 1.452 | 1.75 |
| -0.429999999999999 | 1.203 | 1.447 | 1.741 |
| -0.427999999999999 | 1.201 | 1.442 | 1.732 |
| -0.425999999999999 | 1.199 | 1.438 | 1.724 |
| -0.423999999999999 | 1.197 | 1.433 | 1.715 |
| -0.421999999999999 | 1.195 | 1.428 | 1.706 |
| -0.419999999999999 | 1.193 | 1.423 | 1.698 |
| -0.417999999999999 | 1.191 | 1.418 | 1.689 |
| -0.415999999999999 | 1.189 | 1.414 | 1.681 |
| -0.413999999999999 | 1.187 | 1.409 | 1.672 |
| -0.411999999999999 | 1.185 | 1.404 | 1.664 |
| -0.409999999999999 | 1.183 | 1.4 | 1.656 |
| -0.407999999999999 | 1.181 | 1.395 | 1.648 |
| -0.405999999999999 | 1.179 | 1.391 | 1.64 |
| -0.403999999999999 | 1.177 | 1.386 | 1.632 |
| -0.401999999999999 | 1.175 | 1.382 | 1.624 |
| -0.399999999999999 | 1.174 | 1.377 | 1.616 |
| -0.397999999999999 | 1.172 | 1.373 | 1.608 |
| -0.395999999999999 | 1.17 | 1.368 | 1.601 |
| -0.393999999999999 | 1.168 | 1.364 | 1.593 |
| -0.391999999999999 | 1.166 | 1.36 | 1.586 |
| -0.389999999999999 | 1.164 | 1.356 | 1.578 |
| -0.387999999999999 | 1.162 | 1.351 | 1.571 |
| -0.385999999999999 | 1.161 | 1.347 | 1.564 |
| -0.383999999999999 | 1.159 | 1.343 | 1.556 |
| -0.381999999999999 | 1.157 | 1.339 | 1.549 |
| -0.379999999999999 | 1.155 | 1.335 | 1.542 |
| -0.377999999999999 | 1.154 | 1.331 | 1.535 |
| -0.375999999999999 | 1.152 | 1.327 | 1.528 |
| -0.373999999999999 | 1.15 | 1.323 | 1.521 |
| -0.371999999999999 | 1.148 | 1.319 | 1.515 |
| -0.369999999999998 | 1.147 | 1.315 | 1.508 |
| -0.367999999999998 | 1.145 | 1.311 | 1.501 |
| -0.365999999999998 | 1.143 | 1.307 | 1.495 |
| -0.363999999999998 | 1.142 | 1.303 | 1.488 |
| -0.361999999999998 | 1.14 | 1.3 | 1.482 |
| -0.359999999999998 | 1.138 | 1.296 | 1.475 |
| -0.357999999999998 | 1.137 | 1.292 | 1.469 |
| -0.355999999999998 | 1.135 | 1.288 | 1.463 |
| -0.353999999999998 | 1.134 | 1.285 | 1.456 |
| -0.351999999999998 | 1.132 | 1.281 | 1.45 |
| -0.349999999999998 | 1.13 | 1.278 | 1.444 |
| -0.347999999999998 | 1.129 | 1.274 | 1.438 |
| -0.345999999999998 | 1.127 | 1.271 | 1.432 |
| -0.343999999999998 | 1.126 | 1.267 | 1.426 |
| -0.341999999999998 | 1.124 | 1.264 | 1.42 |
| -0.339999999999998 | 1.123 | 1.26 | 1.415 |
| -0.337999999999998 | 1.121 | 1.257 | 1.409 |
| -0.335999999999998 | 1.12 | 1.253 | 1.403 |
| -0.333999999999998 | 1.118 | 1.25 | 1.397 |
| -0.331999999999998 | 1.117 | 1.247 | 1.392 |
| -0.329999999999998 | 1.115 | 1.243 | 1.386 |
| -0.327999999999998 | 1.114 | 1.24 | 1.381 |
| -0.325999999999998 | 1.112 | 1.237 | 1.376 |
| -0.323999999999998 | 1.111 | 1.234 | 1.37 |
| -0.321999999999998 | 1.109 | 1.23 | 1.365 |
| -0.319999999999998 | 1.108 | 1.227 | 1.36 |
| -0.317999999999998 | 1.106 | 1.224 | 1.354 |
| -0.315999999999998 | 1.105 | 1.221 | 1.349 |
| -0.313999999999998 | 1.104 | 1.218 | 1.344 |
| -0.311999999999998 | 1.102 | 1.215 | 1.339 |
| -0.309999999999998 | 1.101 | 1.212 | 1.334 |
| -0.307999999999998 | 1.1 | 1.209 | 1.329 |
| -0.305999999999998 | 1.098 | 1.206 | 1.324 |
| -0.303999999999998 | 1.097 | 1.203 | 1.319 |
| -0.301999999999998 | 1.095 | 1.2 | 1.315 |
| -0.299999999999998 | 1.094 | 1.197 | 1.31 |
| -0.297999999999998 | 1.093 | 1.194 | 1.305 |
| -0.295999999999998 | 1.092 | 1.192 | 1.301 |
| -0.293999999999998 | 1.09 | 1.189 | 1.296 |
| -0.291999999999998 | 1.089 | 1.186 | 1.291 |
| -0.289999999999998 | 1.088 | 1.183 | 1.287 |
| -0.287999999999998 | 1.086 | 1.18 | 1.283 |
| -0.285999999999998 | 1.085 | 1.178 | 1.278 |
| -0.283999999999998 | 1.084 | 1.175 | 1.274 |
| -0.281999999999998 | 1.083 | 1.172 | 1.269 |
| -0.279999999999998 | 1.082 | 1.17 | 1.265 |
| -0.277999999999998 | 1.08 | 1.167 | 1.261 |
| -0.275999999999998 | 1.079 | 1.165 | 1.257 |
| -0.273999999999998 | 1.078 | 1.162 | 1.253 |
| -0.271999999999998 | 1.077 | 1.159 | 1.249 |
| -0.269999999999998 | 1.076 | 1.157 | 1.244 |
| -0.267999999999998 | 1.074 | 1.154 | 1.24 |
| -0.265999999999998 | 1.073 | 1.152 | 1.236 |
| -0.263999999999998 | 1.072 | 1.15 | 1.233 |
| -0.261999999999998 | 1.071 | 1.147 | 1.229 |
| -0.259999999999998 | 1.07 | 1.145 | 1.225 |
| -0.257999999999998 | 1.069 | 1.142 | 1.221 |
| -0.255999999999998 | 1.068 | 1.14 | 1.217 |
| -0.253999999999998 | 1.067 | 1.138 | 1.214 |
| -0.251999999999998 | 1.066 | 1.135 | 1.21 |
| -0.249999999999998 | 1.064 | 1.133 | 1.206 |
| -0.247999999999998 | 1.063 | 1.131 | 1.203 |
| -0.245999999999998 | 1.062 | 1.129 | 1.199 |
| -0.243999999999998 | 1.061 | 1.126 | 1.196 |
| -0.241999999999998 | 1.06 | 1.124 | 1.192 |
| -0.239999999999998 | 1.059 | 1.122 | 1.189 |
| -0.237999999999998 | 1.058 | 1.12 | 1.185 |
| -0.235999999999998 | 1.057 | 1.118 | 1.182 |
| -0.233999999999998 | 1.056 | 1.116 | 1.179 |
| -0.231999999999998 | 1.055 | 1.114 | 1.175 |
| -0.229999999999998 | 1.054 | 1.112 | 1.172 |
| -0.227999999999998 | 1.053 | 1.11 | 1.169 |
| -0.225999999999998 | 1.052 | 1.108 | 1.166 |
| -0.223999999999998 | 1.051 | 1.106 | 1.162 |
| -0.221999999999998 | 1.051 | 1.104 | 1.159 |
| -0.219999999999998 | 1.05 | 1.102 | 1.156 |
| -0.217999999999998 | 1.049 | 1.1 | 1.153 |
| -0.215999999999998 | 1.048 | 1.098 | 1.15 |
| -0.213999999999998 | 1.047 | 1.096 | 1.147 |
| -0.211999999999998 | 1.046 | 1.094 | 1.144 |
| -0.209999999999998 | 1.045 | 1.092 | 1.141 |
| -0.207999999999998 | 1.044 | 1.09 | 1.139 |
| -0.205999999999998 | 1.043 | 1.089 | 1.136 |
| -0.203999999999998 | 1.042 | 1.087 | 1.133 |
| -0.201999999999998 | 1.042 | 1.085 | 1.13 |
| -0.199999999999998 | 1.041 | 1.083 | 1.127 |
| -0.197999999999998 | 1.04 | 1.082 | 1.125 |
| -0.195999999999998 | 1.039 | 1.08 | 1.122 |
| -0.193999999999998 | 1.038 | 1.078 | 1.12 |
| -0.191999999999998 | 1.038 | 1.077 | 1.117 |
| -0.189999999999998 | 1.037 | 1.075 | 1.114 |
| -0.187999999999998 | 1.036 | 1.073 | 1.112 |
| -0.185999999999998 | 1.035 | 1.072 | 1.109 |
| -0.183999999999998 | 1.034 | 1.07 | 1.107 |
| -0.181999999999998 | 1.034 | 1.068 | 1.104 |
| -0.179999999999998 | 1.033 | 1.067 | 1.102 |
| -0.177999999999998 | 1.032 | 1.065 | 1.1 |
| -0.175999999999998 | 1.031 | 1.064 | 1.097 |
| -0.173999999999998 | 1.031 | 1.062 | 1.095 |
| -0.171999999999998 | 1.03 | 1.061 | 1.093 |
| -0.169999999999998 | 1.029 | 1.06 | 1.091 |
| -0.167999999999998 | 1.029 | 1.058 | 1.088 |
| -0.165999999999998 | 1.028 | 1.057 | 1.086 |
| -0.163999999999998 | 1.027 | 1.055 | 1.084 |
| -0.161999999999998 | 1.027 | 1.054 | 1.082 |
| -0.159999999999998 | 1.026 | 1.053 | 1.08 |
| -0.157999999999998 | 1.025 | 1.051 | 1.078 |
| -0.155999999999998 | 1.025 | 1.05 | 1.076 |
| -0.153999999999998 | 1.024 | 1.049 | 1.074 |
| -0.151999999999998 | 1.023 | 1.047 | 1.072 |
| -0.149999999999998 | 1.023 | 1.046 | 1.07 |
| -0.147999999999998 | 1.022 | 1.045 | 1.068 |
| -0.145999999999998 | 1.022 | 1.044 | 1.066 |
| -0.143999999999998 | 1.021 | 1.042 | 1.064 |
| -0.141999999999998 | 1.02 | 1.041 | 1.062 |
| -0.139999999999998 | 1.02 | 1.04 | 1.061 |
| -0.137999999999998 | 1.019 | 1.039 | 1.059 |
| -0.135999999999998 | 1.019 | 1.038 | 1.057 |
| -0.133999999999998 | 1.018 | 1.037 | 1.055 |
| -0.131999999999998 | 1.018 | 1.035 | 1.054 |
| -0.129999999999998 | 1.017 | 1.034 | 1.052 |
| -0.127999999999998 | 1.017 | 1.033 | 1.05 |
| -0.125999999999998 | 1.016 | 1.032 | 1.049 |
| -0.123999999999998 | 1.015 | 1.031 | 1.047 |
| -0.121999999999998 | 1.015 | 1.03 | 1.046 |
| -0.119999999999998 | 1.015 | 1.029 | 1.044 |
| -0.117999999999998 | 1.014 | 1.028 | 1.043 |
| -0.115999999999998 | 1.014 | 1.027 | 1.041 |
| -0.113999999999998 | 1.013 | 1.026 | 1.04 |
| -0.111999999999998 | 1.013 | 1.025 | 1.038 |
| -0.109999999999998 | 1.012 | 1.024 | 1.037 |
| -0.107999999999998 | 1.012 | 1.024 | 1.036 |
| -0.105999999999998 | 1.011 | 1.023 | 1.034 |
| -0.103999999999998 | 1.011 | 1.022 | 1.033 |
| -0.101999999999998 | 1.01 | 1.021 | 1.032 |
| -0.0999999999999983 | 1.01 | 1.02 | 1.03 |
| -0.0979999999999983 | 1.01 | 1.019 | 1.029 |
| -0.0959999999999983 | 1.009 | 1.019 | 1.028 |
| -0.0939999999999983 | 1.009 | 1.018 | 1.027 |
| -0.0919999999999983 | 1.008 | 1.017 | 1.026 |
| -0.0899999999999983 | 1.008 | 1.016 | 1.025 |
| -0.0879999999999983 | 1.008 | 1.016 | 1.024 |
| -0.0859999999999983 | 1.007 | 1.015 | 1.022 |
| -0.0839999999999983 | 1.007 | 1.014 | 1.021 |
| -0.0819999999999983 | 1.007 | 1.014 | 1.02 |
| -0.0799999999999983 | 1.006 | 1.013 | 1.019 |
| -0.0779999999999983 | 1.006 | 1.012 | 1.018 |
| -0.0759999999999983 | 1.006 | 1.012 | 1.017 |
| -0.0739999999999983 | 1.005 | 1.011 | 1.017 |
| -0.0719999999999983 | 1.005 | 1.01 | 1.016 |
| -0.0699999999999983 | 1.005 | 1.01 | 1.015 |
| -0.0679999999999983 | 1.005 | 1.009 | 1.014 |
| -0.0659999999999983 | 1.004 | 1.009 | 1.013 |
| -0.0639999999999983 | 1.004 | 1.008 | 1.012 |
| -0.0619999999999983 | 1.004 | 1.008 | 1.012 |
| -0.0599999999999983 | 1.004 | 1.007 | 1.011 |
| -0.0579999999999983 | 1.003 | 1.007 | 1.01 |
| -0.0559999999999983 | 1.003 | 1.006 | 1.009 |
| -0.0539999999999983 | 1.003 | 1.006 | 1.009 |
| -0.0519999999999983 | 1.003 | 1.005 | 1.008 |
| -0.0499999999999983 | 1.003 | 1.005 | 1.008 |
| -0.0479999999999983 | 1.002 | 1.005 | 1.007 |
| -0.0459999999999983 | 1.002 | 1.004 | 1.006 |
| -0.0439999999999983 | 1.002 | 1.004 | 1.006 |
| -0.0419999999999983 | 1.002 | 1.004 | 1.005 |
| -0.0399999999999983 | 1.002 | 1.003 | 1.005 |
| -0.0379999999999982 | 1.001 | 1.003 | 1.004 |
| -0.0359999999999982 | 1.001 | 1.003 | 1.004 |
| -0.0339999999999982 | 1.001 | 1.002 | 1.003 |
| -0.0319999999999982 | 1.001 | 1.002 | 1.003 |
| -0.0299999999999982 | 1.001 | 1.002 | 1.003 |
| -0.0279999999999982 | 1.001 | 1.002 | 1.002 |
| -0.0259999999999982 | 1.001 | 1.001 | 1.002 |
| -0.0239999999999982 | 1.001 | 1.001 | 1.002 |
| -0.0219999999999982 | 1 | 1.001 | 1.001 |
| -0.0199999999999982 | 1 | 1.001 | 1.001 |
| -0.0179999999999982 | 1 | 1.001 | 1.001 |
| -0.0159999999999982 | 1 | 1.001 | 1.001 |
| -0.0139999999999982 | 1 | 1 | 1.001 |
| -0.0119999999999982 | 1 | 1 | 1 |
| -0.00999999999999823 | 1 | 1 | 1 |
| -0.00799999999999824 | 1 | 1 | 1 |
| -0.00599999999999824 | 1 | 1 | 1 |
| -0.00399999999999824 | 1 | 1 | 1 |
| -0.00199999999999824 | 1 | 1 | 1 |
| 1.76247905159244e-15 | 1 | 1 | 1 |
| 0.00200000000000176 | 1 | 1 | 1 |
| 0.00400000000000176 | 1 | 1 | 1 |
| 0.00600000000000176 | 1 | 1 | 1 |
| 0.00800000000000176 | 1 | 1 | 1 |
| 0.0100000000000018 | 1 | 1 | 1 |
| 0.0120000000000018 | 1 | 1 | 1 |
| 0.0140000000000018 | 1 | 1 | 1.001 |
| 0.0160000000000018 | 1 | 1.001 | 1.001 |
| 0.0180000000000018 | 1 | 1.001 | 1.001 |
| 0.0200000000000018 | 1 | 1.001 | 1.001 |
| 0.0220000000000018 | 1 | 1.001 | 1.001 |
| 0.0240000000000018 | 1.001 | 1.001 | 1.002 |
| 0.0260000000000018 | 1.001 | 1.001 | 1.002 |
| 0.0280000000000018 | 1.001 | 1.002 | 1.002 |
| 0.0300000000000018 | 1.001 | 1.002 | 1.003 |
| 0.0320000000000018 | 1.001 | 1.002 | 1.003 |
| 0.0340000000000018 | 1.001 | 1.002 | 1.003 |
| 0.0360000000000018 | 1.001 | 1.003 | 1.004 |
| 0.0380000000000018 | 1.001 | 1.003 | 1.004 |
| 0.0400000000000018 | 1.002 | 1.003 | 1.005 |
| 0.0420000000000018 | 1.002 | 1.004 | 1.005 |
| 0.0440000000000018 | 1.002 | 1.004 | 1.006 |
| 0.0460000000000018 | 1.002 | 1.004 | 1.006 |
| 0.0480000000000018 | 1.002 | 1.005 | 1.007 |
| 0.0500000000000018 | 1.003 | 1.005 | 1.008 |
| 0.0520000000000018 | 1.003 | 1.005 | 1.008 |
| 0.0540000000000018 | 1.003 | 1.006 | 1.009 |
| 0.0560000000000018 | 1.003 | 1.006 | 1.009 |
| 0.0580000000000018 | 1.003 | 1.007 | 1.01 |
| 0.0600000000000018 | 1.004 | 1.007 | 1.011 |
| 0.0620000000000018 | 1.004 | 1.008 | 1.012 |
| 0.0640000000000018 | 1.004 | 1.008 | 1.012 |
| 0.0660000000000018 | 1.004 | 1.009 | 1.013 |
| 0.0680000000000018 | 1.005 | 1.009 | 1.014 |
| 0.0700000000000018 | 1.005 | 1.01 | 1.015 |
| 0.0720000000000018 | 1.005 | 1.01 | 1.016 |
| 0.0740000000000018 | 1.005 | 1.011 | 1.017 |
| 0.0760000000000018 | 1.006 | 1.012 | 1.017 |
| 0.0780000000000018 | 1.006 | 1.012 | 1.018 |
| 0.0800000000000018 | 1.006 | 1.013 | 1.019 |
| 0.0820000000000018 | 1.007 | 1.014 | 1.02 |
| 0.0840000000000018 | 1.007 | 1.014 | 1.021 |
| 0.0860000000000018 | 1.007 | 1.015 | 1.022 |
| 0.0880000000000018 | 1.008 | 1.016 | 1.024 |
| 0.0900000000000018 | 1.008 | 1.016 | 1.025 |
| 0.0920000000000018 | 1.008 | 1.017 | 1.026 |
| 0.0940000000000018 | 1.009 | 1.018 | 1.027 |
| 0.0960000000000018 | 1.009 | 1.019 | 1.028 |
| 0.0980000000000018 | 1.01 | 1.019 | 1.029 |
| 0.100000000000002 | 1.01 | 1.02 | 1.03 |
| 0.102000000000002 | 1.01 | 1.021 | 1.032 |
| 0.104000000000002 | 1.011 | 1.022 | 1.033 |
| 0.106000000000002 | 1.011 | 1.023 | 1.034 |
| 0.108000000000002 | 1.012 | 1.024 | 1.036 |
| 0.110000000000002 | 1.012 | 1.024 | 1.037 |
| 0.112000000000002 | 1.013 | 1.025 | 1.038 |
| 0.114000000000002 | 1.013 | 1.026 | 1.04 |
| 0.116000000000002 | 1.014 | 1.027 | 1.041 |
| 0.118000000000002 | 1.014 | 1.028 | 1.043 |
| 0.120000000000002 | 1.015 | 1.029 | 1.044 |
| 0.122000000000002 | 1.015 | 1.03 | 1.046 |
| 0.124000000000002 | 1.015 | 1.031 | 1.047 |
| 0.126000000000002 | 1.016 | 1.032 | 1.049 |
| 0.128000000000002 | 1.017 | 1.033 | 1.05 |
| 0.130000000000002 | 1.017 | 1.034 | 1.052 |
| 0.132000000000002 | 1.018 | 1.035 | 1.054 |
| 0.134000000000002 | 1.018 | 1.037 | 1.055 |
| 0.136000000000002 | 1.019 | 1.038 | 1.057 |
| 0.138000000000002 | 1.019 | 1.039 | 1.059 |
| 0.140000000000002 | 1.02 | 1.04 | 1.061 |
| 0.142000000000002 | 1.02 | 1.041 | 1.062 |
| 0.144000000000002 | 1.021 | 1.042 | 1.064 |
| 0.146000000000002 | 1.022 | 1.044 | 1.066 |
| 0.148000000000002 | 1.022 | 1.045 | 1.068 |
| 0.150000000000002 | 1.023 | 1.046 | 1.07 |
| 0.152000000000002 | 1.023 | 1.047 | 1.072 |
| 0.154000000000002 | 1.024 | 1.049 | 1.074 |
| 0.156000000000002 | 1.025 | 1.05 | 1.076 |
| 0.158000000000002 | 1.025 | 1.051 | 1.078 |
| 0.160000000000002 | 1.026 | 1.053 | 1.08 |
| 0.162000000000002 | 1.027 | 1.054 | 1.082 |
| 0.164000000000002 | 1.027 | 1.055 | 1.084 |
| 0.166000000000002 | 1.028 | 1.057 | 1.086 |
| 0.168000000000002 | 1.029 | 1.058 | 1.088 |
| 0.170000000000002 | 1.029 | 1.06 | 1.091 |
| 0.172000000000002 | 1.03 | 1.061 | 1.093 |
| 0.174000000000002 | 1.031 | 1.062 | 1.095 |
| 0.176000000000002 | 1.031 | 1.064 | 1.097 |
| 0.178000000000002 | 1.032 | 1.065 | 1.1 |
| 0.180000000000002 | 1.033 | 1.067 | 1.102 |
| 0.182000000000002 | 1.034 | 1.068 | 1.104 |
| 0.184000000000002 | 1.034 | 1.07 | 1.107 |
| 0.186000000000002 | 1.035 | 1.072 | 1.109 |
| 0.188000000000002 | 1.036 | 1.073 | 1.112 |
| 0.190000000000002 | 1.037 | 1.075 | 1.114 |
| 0.192000000000002 | 1.038 | 1.077 | 1.117 |
| 0.194000000000002 | 1.038 | 1.078 | 1.12 |
| 0.196000000000002 | 1.039 | 1.08 | 1.122 |
| 0.198000000000002 | 1.04 | 1.082 | 1.125 |
| 0.200000000000002 | 1.041 | 1.083 | 1.127 |
| 0.202000000000002 | 1.042 | 1.085 | 1.13 |
| 0.204000000000002 | 1.042 | 1.087 | 1.133 |
| 0.206000000000002 | 1.043 | 1.089 | 1.136 |
| 0.208000000000002 | 1.044 | 1.09 | 1.139 |
| 0.210000000000002 | 1.045 | 1.092 | 1.141 |
| 0.212000000000002 | 1.046 | 1.094 | 1.144 |
| 0.214000000000002 | 1.047 | 1.096 | 1.147 |
| 0.216000000000002 | 1.048 | 1.098 | 1.15 |
| 0.218000000000002 | 1.049 | 1.1 | 1.153 |
| 0.220000000000002 | 1.05 | 1.102 | 1.156 |
| 0.222000000000002 | 1.051 | 1.104 | 1.159 |
| 0.224000000000002 | 1.051 | 1.106 | 1.162 |
| 0.226000000000002 | 1.052 | 1.108 | 1.166 |
| 0.228000000000002 | 1.053 | 1.11 | 1.169 |
| 0.230000000000002 | 1.054 | 1.112 | 1.172 |
| 0.232000000000002 | 1.055 | 1.114 | 1.175 |
| 0.234000000000002 | 1.056 | 1.116 | 1.179 |
| 0.236000000000002 | 1.057 | 1.118 | 1.182 |
| 0.238000000000002 | 1.058 | 1.12 | 1.185 |
| 0.240000000000002 | 1.059 | 1.122 | 1.189 |
| 0.242000000000002 | 1.06 | 1.124 | 1.192 |
| 0.244000000000002 | 1.061 | 1.126 | 1.196 |
| 0.246000000000002 | 1.062 | 1.129 | 1.199 |
| 0.248000000000002 | 1.063 | 1.131 | 1.203 |
| 0.250000000000002 | 1.064 | 1.133 | 1.206 |
| 0.252000000000002 | 1.066 | 1.135 | 1.21 |
| 0.254000000000002 | 1.067 | 1.138 | 1.214 |
| 0.256000000000002 | 1.068 | 1.14 | 1.217 |
| 0.258000000000002 | 1.069 | 1.142 | 1.221 |
| 0.260000000000002 | 1.07 | 1.145 | 1.225 |
| 0.262000000000002 | 1.071 | 1.147 | 1.229 |
| 0.264000000000002 | 1.072 | 1.15 | 1.233 |
| 0.266000000000002 | 1.073 | 1.152 | 1.236 |
| 0.268000000000002 | 1.074 | 1.154 | 1.24 |
| 0.270000000000002 | 1.076 | 1.157 | 1.244 |
| 0.272000000000002 | 1.077 | 1.159 | 1.249 |
| 0.274000000000002 | 1.078 | 1.162 | 1.253 |
| 0.276000000000002 | 1.079 | 1.165 | 1.257 |
| 0.278000000000002 | 1.08 | 1.167 | 1.261 |
| 0.280000000000002 | 1.082 | 1.17 | 1.265 |
| 0.282000000000002 | 1.083 | 1.172 | 1.269 |
| 0.284000000000002 | 1.084 | 1.175 | 1.274 |
| 0.286000000000002 | 1.085 | 1.178 | 1.278 |
| 0.288000000000002 | 1.086 | 1.18 | 1.283 |
| 0.290000000000002 | 1.088 | 1.183 | 1.287 |
| 0.292000000000002 | 1.089 | 1.186 | 1.291 |
| 0.294000000000002 | 1.09 | 1.189 | 1.296 |
| 0.296000000000002 | 1.092 | 1.192 | 1.301 |
| 0.298000000000002 | 1.093 | 1.194 | 1.305 |
| 0.300000000000002 | 1.094 | 1.197 | 1.31 |
| 0.302000000000002 | 1.095 | 1.2 | 1.315 |
| 0.304000000000002 | 1.097 | 1.203 | 1.319 |
| 0.306000000000002 | 1.098 | 1.206 | 1.324 |
| 0.308000000000002 | 1.1 | 1.209 | 1.329 |
| 0.310000000000002 | 1.101 | 1.212 | 1.334 |
| 0.312000000000002 | 1.102 | 1.215 | 1.339 |
| 0.314000000000002 | 1.104 | 1.218 | 1.344 |
| 0.316000000000002 | 1.105 | 1.221 | 1.349 |
| 0.318000000000002 | 1.106 | 1.224 | 1.354 |
| 0.320000000000002 | 1.108 | 1.227 | 1.36 |
| 0.322000000000002 | 1.109 | 1.23 | 1.365 |
| 0.324000000000002 | 1.111 | 1.234 | 1.37 |
| 0.326000000000002 | 1.112 | 1.237 | 1.376 |
| 0.328000000000002 | 1.114 | 1.24 | 1.381 |
| 0.330000000000002 | 1.115 | 1.243 | 1.386 |
| 0.332000000000002 | 1.117 | 1.247 | 1.392 |
| 0.334000000000002 | 1.118 | 1.25 | 1.397 |
| 0.336000000000002 | 1.12 | 1.253 | 1.403 |
| 0.338000000000002 | 1.121 | 1.257 | 1.409 |
| 0.340000000000002 | 1.123 | 1.26 | 1.415 |
| 0.342000000000002 | 1.124 | 1.264 | 1.42 |
| 0.344000000000002 | 1.126 | 1.267 | 1.426 |
| 0.346000000000002 | 1.127 | 1.271 | 1.432 |
| 0.348000000000002 | 1.129 | 1.274 | 1.438 |
| 0.350000000000002 | 1.13 | 1.278 | 1.444 |
| 0.352000000000002 | 1.132 | 1.281 | 1.45 |
| 0.354000000000002 | 1.134 | 1.285 | 1.456 |
| 0.356000000000002 | 1.135 | 1.288 | 1.463 |
| 0.358000000000002 | 1.137 | 1.292 | 1.469 |
| 0.360000000000002 | 1.138 | 1.296 | 1.475 |
| 0.362000000000002 | 1.14 | 1.3 | 1.482 |
| 0.364000000000002 | 1.142 | 1.303 | 1.488 |
| 0.366000000000002 | 1.143 | 1.307 | 1.495 |
| 0.368000000000002 | 1.145 | 1.311 | 1.501 |
| 0.370000000000002 | 1.147 | 1.315 | 1.508 |
| 0.372000000000002 | 1.148 | 1.319 | 1.515 |
| 0.374000000000002 | 1.15 | 1.323 | 1.521 |
| 0.376000000000002 | 1.152 | 1.327 | 1.528 |
| 0.378000000000002 | 1.154 | 1.331 | 1.535 |
| 0.380000000000002 | 1.155 | 1.335 | 1.542 |
| 0.382000000000002 | 1.157 | 1.339 | 1.549 |
| 0.384000000000002 | 1.159 | 1.343 | 1.556 |
| 0.386000000000002 | 1.161 | 1.347 | 1.564 |
| 0.388000000000002 | 1.162 | 1.351 | 1.571 |
| 0.390000000000002 | 1.164 | 1.356 | 1.578 |
| 0.392000000000002 | 1.166 | 1.36 | 1.586 |
| 0.394000000000002 | 1.168 | 1.364 | 1.593 |
| 0.396000000000002 | 1.17 | 1.368 | 1.601 |
| 0.398000000000002 | 1.172 | 1.373 | 1.608 |
| 0.400000000000002 | 1.174 | 1.377 | 1.616 |
| 0.402000000000002 | 1.175 | 1.382 | 1.624 |
| 0.404000000000002 | 1.177 | 1.386 | 1.632 |
| 0.406000000000002 | 1.179 | 1.391 | 1.64 |
| 0.408000000000002 | 1.181 | 1.395 | 1.648 |
| 0.410000000000002 | 1.183 | 1.4 | 1.656 |
| 0.412000000000002 | 1.185 | 1.404 | 1.664 |
| 0.414000000000002 | 1.187 | 1.409 | 1.672 |
| 0.416000000000002 | 1.189 | 1.414 | 1.681 |
| 0.418000000000002 | 1.191 | 1.418 | 1.689 |
| 0.420000000000002 | 1.193 | 1.423 | 1.698 |
| 0.422000000000002 | 1.195 | 1.428 | 1.706 |
| 0.424000000000002 | 1.197 | 1.433 | 1.715 |
| 0.426000000000002 | 1.199 | 1.438 | 1.724 |
| 0.428000000000002 | 1.201 | 1.442 | 1.732 |
| 0.430000000000002 | 1.203 | 1.447 | 1.741 |
| 0.432000000000002 | 1.205 | 1.452 | 1.75 |
| 0.434000000000002 | 1.207 | 1.457 | 1.76 |
| 0.436000000000002 | 1.209 | 1.463 | 1.769 |
| 0.438000000000002 | 1.211 | 1.468 | 1.778 |
| 0.440000000000002 | 1.214 | 1.473 | 1.787 |
| 0.442000000000002 | 1.216 | 1.478 | 1.797 |
| 0.444000000000002 | 1.218 | 1.483 | 1.807 |
| 0.446000000000002 | 1.22 | 1.489 | 1.816 |
| 0.448000000000002 | 1.222 | 1.494 | 1.826 |
| 0.450000000000002 | 1.224 | 1.499 | 1.836 |
| 0.452000000000002 | 1.227 | 1.505 | 1.846 |
| 0.454000000000002 | 1.229 | 1.51 | 1.856 |
| 0.456000000000002 | 1.231 | 1.516 | 1.866 |
| 0.458000000000002 | 1.233 | 1.521 | 1.876 |
| 0.460000000000002 | 1.236 | 1.527 | 1.887 |
| 0.462000000000002 | 1.238 | 1.532 | 1.897 |
| 0.464000000000002 | 1.24 | 1.538 | 1.908 |
| 0.466000000000002 | 1.243 | 1.544 | 1.918 |
| 0.468000000000002 | 1.245 | 1.55 | 1.929 |
| 0.470000000000002 | 1.247 | 1.556 | 1.94 |
| 0.472000000000002 | 1.25 | 1.561 | 1.951 |
| 0.474000000000002 | 1.252 | 1.567 | 1.962 |
| 0.476000000000002 | 1.254 | 1.573 | 1.973 |
| 0.478000000000002 | 1.257 | 1.579 | 1.985 |
| 0.480000000000002 | 1.259 | 1.585 | 1.996 |
| 0.482000000000002 | 1.262 | 1.591 | 2.008 |
| 0.484000000000002 | 1.264 | 1.598 | 2.019 |
| 0.486000000000002 | 1.266 | 1.604 | 2.031 |
| 0.488000000000002 | 1.269 | 1.61 | 2.043 |
| 0.490000000000002 | 1.271 | 1.616 | 2.055 |
| 0.492000000000002 | 1.274 | 1.623 | 2.067 |
| 0.494000000000002 | 1.276 | 1.629 | 2.079 |
| 0.496000000000002 | 1.279 | 1.636 | 2.092 |
| 0.498000000000002 | 1.281 | 1.642 | 2.104 |
| 0.500000000000002 | 1.284 | 1.649 | 2.117 |
| 0.502000000000002 | 1.287 | 1.655 | 2.13 |
| 0.504000000000002 | 1.289 | 1.662 | 2.143 |
| 0.506000000000002 | 1.292 | 1.669 | 2.156 |
| 0.508000000000002 | 1.294 | 1.676 | 2.169 |
| 0.510000000000002 | 1.297 | 1.682 | 2.182 |
| 0.512000000000002 | 1.3 | 1.689 | 2.196 |
| 0.514000000000002 | 1.302 | 1.696 | 2.209 |
| 0.516000000000002 | 1.305 | 1.703 | 2.223 |
| 0.518000000000002 | 1.308 | 1.71 | 2.237 |
| 0.520000000000002 | 1.31 | 1.717 | 2.251 |
| 0.522000000000002 | 1.313 | 1.725 | 2.265 |
| 0.524000000000002 | 1.316 | 1.732 | 2.279 |
| 0.526000000000002 | 1.319 | 1.739 | 2.293 |
| 0.528000000000002 | 1.322 | 1.746 | 2.308 |
| 0.530000000000002 | 1.324 | 1.754 | 2.323 |
| 0.532000000000002 | 1.327 | 1.761 | 2.337 |
| 0.534000000000002 | 1.33 | 1.769 | 2.352 |
| 0.536000000000002 | 1.333 | 1.776 | 2.368 |
| 0.538000000000002 | 1.336 | 1.784 | 2.383 |
| 0.540000000000002 | 1.339 | 1.792 | 2.398 |
| 0.542000000000002 | 1.341 | 1.8 | 2.414 |
| 0.544000000000002 | 1.344 | 1.807 | 2.43 |
| 0.546000000000002 | 1.347 | 1.815 | 2.446 |
| 0.548000000000002 | 1.35 | 1.823 | 2.462 |
| 0.550000000000002 | 1.353 | 1.831 | 2.478 |
| 0.552000000000002 | 1.356 | 1.839 | 2.495 |
| 0.554000000000002 | 1.359 | 1.847 | 2.511 |
| 0.556000000000002 | 1.362 | 1.856 | 2.528 |
| 0.558000000000002 | 1.365 | 1.864 | 2.545 |
| 0.560000000000002 | 1.368 | 1.872 | 2.562 |
| 0.562000000000002 | 1.371 | 1.881 | 2.579 |
| 0.564000000000002 | 1.375 | 1.889 | 2.597 |
| 0.566000000000002 | 1.378 | 1.898 | 2.614 |
| 0.568000000000002 | 1.381 | 1.906 | 2.632 |
| 0.570000000000002 | 1.384 | 1.915 | 2.65 |
| 0.572000000000002 | 1.387 | 1.924 | 2.669 |
| 0.574000000000002 | 1.39 | 1.933 | 2.687 |
| 0.576000000000002 | 1.393 | 1.942 | 2.706 |
| 0.578000000000002 | 1.397 | 1.951 | 2.724 |
| 0.580000000000002 | 1.4 | 1.96 | 2.743 |
| 0.582000000000002 | 1.403 | 1.969 | 2.763 |
| 0.584000000000002 | 1.406 | 1.978 | 2.782 |
| 0.586000000000002 | 1.41 | 1.987 | 2.802 |
| 0.588000000000002 | 1.413 | 1.997 | 2.821 |
| 0.590000000000002 | 1.416 | 2.006 | 2.841 |
| 0.592000000000002 | 1.42 | 2.016 | 2.862 |
| 0.594000000000002 | 1.423 | 2.025 | 2.882 |
| 0.596000000000002 | 1.426 | 2.035 | 2.903 |
| 0.598000000000002 | 1.43 | 2.045 | 2.924 |
| 0.600000000000002 | 1.433 | 2.054 | 2.945 |
| 0.602000000000002 | 1.437 | 2.064 | 2.966 |
| 0.604000000000002 | 1.44 | 2.074 | 2.988 |
| 0.606000000000002 | 1.444 | 2.084 | 3.009 |
| 0.608000000000002 | 1.447 | 2.095 | 3.031 |
| 0.610000000000002 | 1.451 | 2.105 | 3.054 |
| 0.612000000000002 | 1.454 | 2.115 | 3.076 |
| 0.614000000000002 | 1.458 | 2.125 | 3.099 |
| 0.616000000000002 | 1.461 | 2.136 | 3.122 |
| 0.618000000000002 | 1.465 | 2.147 | 3.145 |
| 0.620000000000002 | 1.469 | 2.157 | 3.168 |
| 0.622000000000002 | 1.472 | 2.168 | 3.192 |
| 0.624000000000002 | 1.476 | 2.179 | 3.216 |
| 0.626000000000002 | 1.48 | 2.19 | 3.24 |
| 0.628000000000002 | 1.483 | 2.201 | 3.265 |
| 0.630000000000002 | 1.487 | 2.212 | 3.289 |
| 0.632000000000002 | 1.491 | 2.223 | 3.314 |
| 0.634000000000002 | 1.495 | 2.234 | 3.34 |
| 0.636000000000002 | 1.499 | 2.246 | 3.365 |
| 0.638000000000002 | 1.502 | 2.257 | 3.391 |
| 0.640000000000002 | 1.506 | 2.269 | 3.417 |
| 0.642000000000002 | 1.51 | 2.28 | 3.444 |
| 0.644000000000002 | 1.514 | 2.292 | 3.47 |
| 0.646000000000002 | 1.518 | 2.304 | 3.497 |
| 0.648000000000002 | 1.522 | 2.316 | 3.524 |
| 0.650000000000002 | 1.526 | 2.328 | 3.552 |
| 0.652000000000002 | 1.53 | 2.34 | 3.58 |
| 0.654000000000002 | 1.534 | 2.352 | 3.608 |
| 0.656000000000002 | 1.538 | 2.365 | 3.636 |
| 0.658000000000002 | 1.542 | 2.377 | 3.665 |
| 0.660000000000002 | 1.546 | 2.39 | 3.694 |
| 0.662000000000002 | 1.55 | 2.402 | 3.724 |
| 0.664000000000002 | 1.554 | 2.415 | 3.753 |
| 0.666000000000002 | 1.558 | 2.428 | 3.784 |
| 0.668000000000002 | 1.562 | 2.441 | 3.814 |
| 0.670000000000002 | 1.567 | 2.454 | 3.845 |
| 0.672000000000002 | 1.571 | 2.467 | 3.876 |
| 0.674000000000002 | 1.575 | 2.481 | 3.907 |
| 0.676000000000002 | 1.579 | 2.494 | 3.939 |
| 0.678000000000002 | 1.584 | 2.508 | 3.971 |
| 0.680000000000002 | 1.588 | 2.521 | 4.004 |
| 0.682000000000002 | 1.592 | 2.535 | 4.036 |
| 0.684000000000002 | 1.597 | 2.549 | 4.07 |
| 0.686000000000002 | 1.601 | 2.563 | 4.103 |
| 0.688000000000002 | 1.605 | 2.577 | 4.137 |
| 0.690000000000002 | 1.61 | 2.591 | 4.172 |
| 0.692000000000002 | 1.614 | 2.606 | 4.206 |
| 0.694000000000002 | 1.619 | 2.62 | 4.241 |
| 0.696000000000002 | 1.623 | 2.635 | 4.277 |
| 0.698000000000002 | 1.628 | 2.65 | 4.313 |
| 0.700000000000002 | 1.632 | 2.664 | 4.349 |
| 0.702000000000002 | 1.637 | 2.679 | 4.386 |
| 0.704000000000002 | 1.642 | 2.695 | 4.423 |
| 0.706000000000002 | 1.646 | 2.71 | 4.461 |
| 0.708000000000002 | 1.651 | 2.725 | 4.499 |
| 0.710000000000002 | 1.655 | 2.741 | 4.537 |
| 0.712000000000002 | 1.66 | 2.756 | 4.576 |
| 0.714000000000002 | 1.665 | 2.772 | 4.615 |
| 0.716000000000002 | 1.67 | 2.788 | 4.655 |
| 0.718000000000002 | 1.675 | 2.804 | 4.695 |
| 0.720000000000002 | 1.679 | 2.82 | 4.736 |
| 0.722000000000002 | 1.684 | 2.836 | 4.777 |
| 0.724000000000002 | 1.689 | 2.853 | 4.819 |
| 0.726000000000002 | 1.694 | 2.87 | 4.861 |
| 0.728000000000002 | 1.699 | 2.886 | 4.904 |
| 0.730000000000002 | 1.704 | 2.903 | 4.947 |
| 0.732000000000002 | 1.709 | 2.92 | 4.99 |
| 0.734000000000002 | 1.714 | 2.937 | 5.034 |
| 0.736000000000002 | 1.719 | 2.955 | 5.079 |
| 0.738000000000002 | 1.724 | 2.972 | 5.124 |
| 0.740000000000002 | 1.729 | 2.99 | 5.17 |
| 0.742000000000002 | 1.734 | 3.008 | 5.216 |
| 0.744000000000002 | 1.739 | 3.025 | 5.263 |
| 0.746000000000002 | 1.745 | 3.044 | 5.31 |
| 0.748000000000002 | 1.75 | 3.062 | 5.358 |
| 0.750000000000002 | 1.755 | 3.08 | 5.406 |
| 0.752000000000002 | 1.76 | 3.099 | 5.455 |
| 0.754000000000002 | 1.766 | 3.118 | 5.504 |
| 0.756000000000002 | 1.771 | 3.136 | 5.554 |
| 0.758000000000002 | 1.776 | 3.155 | 5.605 |
| 0.760000000000002 | 1.782 | 3.175 | 5.656 |
| 0.762000000000002 | 1.787 | 3.194 | 5.708 |
| 0.764000000000002 | 1.793 | 3.214 | 5.761 |
| 0.766000000000002 | 1.798 | 3.233 | 5.814 |
| 0.768000000000002 | 1.804 | 3.253 | 5.868 |
| 0.770000000000002 | 1.809 | 3.273 | 5.922 |
| 0.772000000000002 | 1.815 | 3.294 | 5.977 |
| 0.774000000000002 | 1.82 | 3.314 | 6.033 |
| 0.776000000000002 | 1.826 | 3.335 | 6.089 |
| 0.778000000000002 | 1.832 | 3.355 | 6.146 |
| 0.780000000000002 | 1.837 | 3.376 | 6.204 |
| 0.782000000000002 | 1.843 | 3.398 | 6.262 |
| 0.784000000000002 | 1.849 | 3.419 | 6.322 |
| 0.786000000000002 | 1.855 | 3.44 | 6.381 |
| 0.788000000000002 | 1.861 | 3.462 | 6.442 |
| 0.790000000000002 | 1.867 | 3.484 | 6.503 |
| 0.792000000000002 | 1.872 | 3.506 | 6.565 |
| 0.794000000000002 | 1.878 | 3.528 | 6.628 |
| 0.796000000000002 | 1.884 | 3.551 | 6.692 |
| 0.798000000000002 | 1.89 | 3.574 | 6.756 |
| 0.800000000000002 | 1.896 | 3.597 | 6.821 |
| 0.802000000000002 | 1.903 | 3.62 | 6.887 |
| 0.804000000000002 | 1.909 | 3.643 | 6.954 |
| 0.806000000000002 | 1.915 | 3.667 | 7.021 |
| 0.808000000000002 | 1.921 | 3.69 | 7.089 |
| 0.810000000000002 | 1.927 | 3.714 | 7.158 |
| 0.812000000000002 | 1.934 | 3.739 | 7.229 |
| 0.814000000000002 | 1.94 | 3.763 | 7.299 |
| 0.816000000000002 | 1.946 | 3.788 | 7.371 |
| 0.818000000000002 | 1.953 | 3.812 | 7.444 |
| 0.820000000000002 | 1.959 | 3.837 | 7.517 |
| 0.822000000000002 | 1.965 | 3.863 | 7.592 |
| 0.824000000000002 | 1.972 | 3.888 | 7.667 |
| 0.826000000000002 | 1.978 | 3.914 | 7.743 |
| 0.828000000000002 | 1.985 | 3.94 | 7.821 |
| 0.830000000000002 | 1.992 | 3.966 | 7.899 |
| 0.832000000000002 | 1.998 | 3.993 | 7.978 |
| 0.834000000000002 | 2.005 | 4.019 | 8.058 |
| 0.836000000000002 | 2.012 | 4.046 | 8.139 |
| 0.838000000000002 | 2.018 | 4.073 | 8.221 |
| 0.840000000000002 | 2.025 | 4.101 | 8.305 |
| 0.842000000000002 | 2.032 | 4.129 | 8.389 |
| 0.844000000000002 | 2.039 | 4.156 | 8.474 |
| 0.846000000000002 | 2.046 | 4.185 | 8.56 |
| 0.848000000000002 | 2.053 | 4.213 | 8.648 |
| 0.850000000000002 | 2.06 | 4.242 | 8.736 |
| 0.852000000000002 | 2.067 | 4.271 | 8.826 |
| 0.854000000000002 | 2.074 | 4.3 | 8.917 |
| 0.856000000000002 | 2.081 | 4.33 | 9.009 |
| 0.858000000000002 | 2.088 | 4.359 | 9.102 |
| 0.860000000000002 | 2.095 | 4.389 | 9.196 |
| 0.862000000000002 | 2.102 | 4.42 | 9.292 |
| 0.864000000000002 | 2.11 | 4.45 | 9.389 |
| 0.866000000000002 | 2.117 | 4.481 | 9.486 |
| 0.868000000000002 | 2.124 | 4.512 | 9.586 |
| 0.870000000000002 | 2.132 | 4.544 | 9.686 |
| 0.872000000000002 | 2.139 | 4.576 | 9.788 |
| 0.874000000000002 | 2.147 | 4.608 | 9.891 |
| 0.876000000000002 | 2.154 | 4.64 | 9.995 |
| 0.878000000000002 | 2.162 | 4.673 | 10.101 |
| 0.880000000000002 | 2.169 | 4.706 | 10.208 |
| 0.882000000000002 | 2.177 | 4.739 | 10.317 |
| 0.884000000000002 | 2.185 | 4.773 | 10.427 |
| 0.886000000000002 | 2.192 | 4.807 | 10.538 |
| 0.888000000000002 | 2.2 | 4.841 | 10.651 |
| 0.890000000000002 | 2.208 | 4.875 | 10.765 |
| 0.892000000000002 | 2.216 | 4.91 | 10.881 |
| 0.894000000000002 | 2.224 | 4.945 | 10.998 |
| 0.896000000000002 | 2.232 | 4.981 | 11.117 |
| 0.898000000000002 | 2.24 | 5.017 | 11.237 |
| 0.900000000000002 | 2.248 | 5.053 | 11.359 |
| 0.902000000000002 | 2.256 | 5.09 | 11.482 |
| 0.904000000000002 | 2.264 | 5.127 | 11.607 |
| 0.906000000000002 | 2.272 | 5.164 | 11.734 |
| 0.908000000000002 | 2.281 | 5.201 | 11.863 |
| 0.910000000000002 | 2.289 | 5.239 | 11.993 |
| 0.912000000000002 | 2.297 | 5.278 | 12.125 |
| 0.914000000000002 | 2.306 | 5.316 | 12.258 |
| 0.916000000000002 | 2.314 | 5.355 | 12.393 |
| 0.918000000000002 | 2.323 | 5.395 | 12.531 |
| 0.920000000000002 | 2.331 | 5.435 | 12.67 |
| 0.922000000000002 | 2.34 | 5.475 | 12.81 |
| 0.924000000000002 | 2.348 | 5.515 | 12.953 |
| 0.926000000000002 | 2.357 | 5.556 | 13.098 |
| 0.928000000000002 | 2.366 | 5.598 | 13.244 |
| 0.930000000000002 | 2.375 | 5.64 | 13.393 |
| 0.932000000000002 | 2.384 | 5.682 | 13.543 |
| 0.934000000000002 | 2.393 | 5.724 | 13.696 |
| 0.936000000000002 | 2.402 | 5.767 | 13.85 |
| 0.938000000000002 | 2.411 | 5.811 | 14.007 |
| 0.940000000000002 | 2.42 | 5.854 | 14.165 |
| 0.942000000000002 | 2.429 | 5.899 | 14.326 |
| 0.944000000000002 | 2.438 | 5.943 | 14.489 |
| 0.946000000000002 | 2.447 | 5.988 | 14.655 |
| 0.948000000000002 | 2.456 | 6.034 | 14.822 |
| 0.950000000000002 | 2.466 | 6.08 | 14.992 |
| 0.952000000000002 | 2.475 | 6.126 | 15.164 |
| 0.954000000000002 | 2.485 | 6.173 | 15.338 |
| 0.956000000000002 | 2.494 | 6.221 | 15.515 |
| 0.958000000000002 | 2.504 | 6.268 | 15.694 |
| 0.960000000000002 | 2.513 | 6.317 | 15.876 |
| 0.962000000000002 | 2.523 | 6.365 | 16.06 |
| 0.964000000000002 | 2.533 | 6.415 | 16.247 |
| 0.966000000000002 | 2.543 | 6.464 | 16.436 |
| 0.968000000000002 | 2.552 | 6.515 | 16.628 |
| 0.970000000000002 | 2.562 | 6.565 | 16.822 |
| 0.972000000000002 | 2.572 | 6.617 | 17.019 |
| 0.974000000000003 | 2.582 | 6.668 | 17.219 |
| 0.976000000000003 | 2.592 | 6.72 | 17.422 |
| 0.978000000000003 | 2.603 | 6.773 | 17.627 |
| 0.980000000000002 | 2.613 | 6.826 | 17.836 |
| 0.982000000000002 | 2.623 | 6.88 | 18.047 |
| 0.984000000000003 | 2.633 | 6.935 | 18.261 |
| 0.986000000000003 | 2.644 | 6.989 | 18.478 |
| 0.988000000000003 | 2.654 | 7.045 | 18.698 |
| 0.990000000000002 | 2.665 | 7.101 | 18.922 |
| 0.992000000000002 | 2.675 | 7.157 | 19.148 |
| 0.994000000000003 | 2.686 | 7.214 | 19.377 |
| 0.996000000000003 | 2.697 | 7.272 | 19.61 |
| 0.998000000000003 | 2.707 | 7.33 | 19.846 |
| 1.000000000000002 | 2.718 | 7.389 | 20.086 |
| 1.002000000000002 | 2.729 | 7.448 | 20.328 |
| 1.004000000000002 | 2.74 | 7.508 | 20.574 |
| 1.006000000000002 | 2.751 | 7.569 | 20.824 |
| 1.008000000000002 | 2.762 | 7.63 | 21.077 |
| 1.010000000000002 | 2.773 | 7.692 | 21.334 |
| 1.012000000000002 | 2.785 | 7.755 | 21.594 |
| 1.014000000000002 | 2.796 | 7.818 | 21.858 |
| 1.016000000000002 | 2.807 | 7.881 | 22.126 |
| 1.018000000000002 | 2.819 | 7.946 | 22.398 |
| 1.020000000000002 | 2.83 | 8.011 | 22.674 |
| 1.022000000000002 | 2.842 | 8.077 | 22.953 |
| 1.024000000000002 | 2.854 | 8.143 | 23.237 |
| 1.026000000000002 | 2.865 | 8.21 | 23.524 |
| 1.028000000000002 | 2.877 | 8.278 | 23.816 |
| 1.030000000000002 | 2.889 | 8.346 | 24.112 |
| 1.032000000000002 | 2.901 | 8.415 | 24.412 |
| 1.034000000000002 | 2.913 | 8.485 | 24.716 |
| 1.036000000000002 | 2.925 | 8.556 | 25.025 |
| 1.038000000000002 | 2.937 | 8.627 | 25.339 |
| 1.040000000000002 | 2.949 | 8.699 | 25.657 |
| 1.042000000000002 | 2.962 | 8.772 | 25.979 |
| 1.044000000000002 | 2.974 | 8.845 | 26.306 |
| 1.046000000000002 | 2.987 | 8.919 | 26.638 |
| 1.048000000000002 | 2.999 | 8.994 | 26.975 |
| 1.050000000000002 | 3.012 | 9.07 | 27.317 |
| 1.052000000000002 | 3.024 | 9.147 | 27.663 |
| 1.054000000000002 | 3.037 | 9.224 | 28.015 |
| 1.056000000000002 | 3.05 | 9.302 | 28.372 |
| 1.058000000000002 | 3.063 | 9.381 | 28.734 |
| 1.060000000000002 | 3.076 | 9.461 | 29.102 |
| 1.062000000000002 | 3.089 | 9.542 | 29.475 |
| 1.064000000000002 | 3.102 | 9.623 | 29.853 |
| 1.066000000000002 | 3.115 | 9.706 | 30.237 |
| 1.068000000000002 | 3.129 | 9.789 | 30.627 |
| 1.070000000000002 | 3.142 | 9.873 | 31.022 |
| 1.072000000000002 | 3.156 | 9.958 | 31.423 |
| 1.074000000000003 | 3.169 | 10.044 | 31.831 |
| 1.076000000000003 | 3.183 | 10.131 | 32.244 |
| 1.078000000000003 | 3.197 | 10.218 | 32.663 |
| 1.080000000000002 | 3.21 | 10.307 | 33.089 |
| 1.082000000000002 | 3.224 | 10.396 | 33.521 |
| 1.084000000000003 | 3.238 | 10.487 | 33.959 |
| 1.086000000000003 | 3.252 | 10.578 | 34.405 |
| 1.088000000000003 | 3.267 | 10.671 | 34.856 |
| 1.090000000000002 | 3.281 | 10.764 | 35.315 |
| 1.092000000000002 | 3.295 | 10.858 | 35.78 |
| 1.094000000000003 | 3.31 | 10.954 | 36.252 |
| 1.096000000000003 | 3.324 | 11.05 | 36.732 |
| 1.098000000000003 | 3.339 | 11.147 | 37.219 |
| 1.100000000000003 | 3.353 | 11.246 | 37.713 |
| 1.102000000000003 | 3.368 | 11.345 | 38.214 |
| 1.104000000000003 | 3.383 | 11.446 | 38.724 |
| 1.106000000000003 | 3.398 | 11.548 | 39.24 |
| 1.108000000000003 | 3.413 | 11.65 | 39.765 |
| 1.110000000000003 | 3.428 | 11.754 | 40.298 |
| 1.112000000000003 | 3.444 | 11.859 | 40.839 |
| 1.114000000000003 | 3.459 | 11.965 | 41.388 |
| 1.116000000000003 | 3.475 | 12.072 | 41.945 |
| 1.118000000000003 | 3.49 | 12.181 | 42.511 |
| 1.120000000000003 | 3.506 | 12.29 | 43.086 |
| 1.122000000000003 | 3.521 | 12.401 | 43.67 |
| 1.124000000000003 | 3.537 | 12.513 | 44.262 |
| 1.126000000000003 | 3.553 | 12.626 | 44.864 |
| 1.128000000000003 | 3.569 | 12.74 | 45.475 |
| 1.130000000000003 | 3.586 | 12.856 | 46.095 |
| 1.132000000000003 | 3.602 | 12.973 | 46.725 |
| 1.134000000000003 | 3.618 | 13.091 | 47.364 |
| 1.136000000000003 | 3.635 | 13.21 | 48.014 |
| 1.138000000000003 | 3.651 | 13.331 | 48.673 |
| 1.140000000000003 | 3.668 | 13.453 | 49.343 |
| 1.142000000000003 | 3.685 | 13.576 | 50.023 |
| 1.144000000000003 | 3.701 | 13.701 | 50.714 |
| 1.146000000000003 | 3.718 | 13.827 | 51.416 |
| 1.148000000000003 | 3.736 | 13.955 | 52.129 |
| 1.150000000000003 | 3.753 | 14.083 | 52.852 |
| 1.152000000000003 | 3.77 | 14.214 | 53.587 |
| 1.154000000000003 | 3.788 | 14.345 | 54.334 |
| 1.156000000000003 | 3.805 | 14.479 | 55.092 |
| 1.158000000000003 | 3.823 | 14.613 | 55.862 |
| 1.160000000000003 | 3.84 | 14.749 | 56.645 |
| 1.162000000000003 | 3.858 | 14.887 | 57.439 |
| 1.164000000000003 | 3.876 | 15.026 | 58.247 |
| 1.166000000000003 | 3.894 | 15.167 | 59.067 |
| 1.168000000000003 | 3.913 | 15.309 | 59.9 |
| 1.170000000000003 | 3.931 | 15.453 | 60.746 |
| 1.172000000000003 | 3.949 | 15.598 | 61.606 |
| 1.174000000000003 | 3.968 | 15.745 | 62.479 |
| 1.176000000000003 | 3.987 | 15.894 | 63.366 |
| 1.178000000000003 | 4.006 | 16.045 | 64.267 |
| 1.180000000000003 | 4.024 | 16.197 | 65.183 |
| 1.182000000000003 | 4.044 | 16.35 | 66.113 |
| 1.184000000000003 | 4.063 | 16.506 | 67.059 |
| 1.186000000000003 | 4.082 | 16.663 | 68.019 |
| 1.188000000000003 | 4.101 | 16.822 | 68.995 |
| 1.190000000000003 | 4.121 | 16.983 | 69.986 |
| 1.192000000000003 | 4.141 | 17.145 | 70.994 |
| 1.194000000000003 | 4.161 | 17.31 | 72.017 |
| 1.196000000000003 | 4.18 | 17.476 | 73.058 |
| 1.198000000000003 | 4.201 | 17.644 | 74.115 |
| 1.200000000000003 | 4.221 | 17.814 | 75.189 |
| 1.202000000000003 | 4.241 | 17.986 | 76.28 |
| 1.204000000000003 | 4.261 | 18.16 | 77.389 |
| 1.206000000000003 | 4.282 | 18.336 | 78.516 |
| 1.208000000000003 | 4.303 | 18.514 | 79.662 |
| 1.210000000000003 | 4.324 | 18.694 | 80.826 |
| 1.212000000000003 | 4.345 | 18.876 | 82.009 |
| 1.214000000000003 | 4.366 | 19.06 | 83.212 |
| 1.216000000000003 | 4.387 | 19.246 | 84.434 |
| 1.218000000000003 | 4.408 | 19.434 | 85.676 |
| 1.220000000000003 | 4.43 | 19.625 | 86.938 |
| 1.222000000000003 | 4.452 | 19.818 | 88.222 |
| 1.224000000000003 | 4.474 | 20.012 | 89.526 |
| 1.226000000000003 | 4.495 | 20.209 | 90.852 |
| 1.228000000000003 | 4.518 | 20.409 | 92.199 |
| 1.230000000000003 | 4.54 | 20.61 | 93.569 |
| 1.232000000000003 | 4.562 | 20.814 | 94.962 |
| 1.234000000000003 | 4.585 | 21.021 | 96.377 |
| 1.236000000000003 | 4.608 | 21.23 | 97.816 |
| 1.238000000000003 | 4.63 | 21.441 | 99.279 |
| 1.240000000000003 | 4.653 | 21.654 | 100.766 |
| 1.242000000000003 | 4.677 | 21.87 | 102.278 |
| 1.244000000000003 | 4.7 | 22.089 | 103.815 |
| 1.246000000000003 | 4.723 | 22.31 | 105.377 |
| 1.248000000000003 | 4.747 | 22.534 | 106.966 |
| 1.250000000000003 | 4.771 | 22.76 | 108.581 |
| 1.252000000000003 | 4.795 | 22.989 | 110.224 |
| 1.254000000000003 | 4.819 | 23.22 | 111.894 |
| 1.256000000000003 | 4.843 | 23.455 | 113.591 |
| 1.258000000000003 | 4.867 | 23.692 | 115.318 |
| 1.260000000000003 | 4.892 | 23.932 | 117.073 |
| 1.262000000000003 | 4.917 | 24.174 | 118.858 |
| 1.264000000000003 | 4.942 | 24.42 | 120.673 |
| 1.266000000000003 | 4.967 | 24.668 | 122.519 |
| 1.268000000000003 | 4.992 | 24.919 | 124.396 |
| 1.270000000000003 | 5.017 | 25.174 | 126.305 |
| 1.272000000000003 | 5.043 | 25.431 | 128.246 |
| 1.274000000000003 | 5.069 | 25.691 | 130.22 |
| 1.276000000000003 | 5.095 | 25.955 | 132.228 |
| 1.278000000000003 | 5.121 | 26.221 | 134.27 |
| 1.280000000000003 | 5.147 | 26.491 | 136.347 |
| 1.282000000000003 | 5.173 | 26.764 | 138.459 |
| 1.284000000000003 | 5.2 | 27.04 | 140.607 |
| 1.286000000000003 | 5.227 | 27.319 | 142.792 |
| 1.288000000000003 | 5.254 | 27.602 | 145.014 |
| 1.290000000000003 | 5.281 | 27.888 | 147.275 |
| 1.292000000000003 | 5.308 | 28.178 | 149.574 |
| 1.294000000000003 | 5.336 | 28.471 | 151.913 |
| 1.296000000000003 | 5.363 | 28.767 | 154.292 |
| 1.298000000000003 | 5.391 | 29.067 | 156.712 |
| 1.300000000000003 | 5.419 | 29.371 | 159.174 |
| 1.302000000000003 | 5.448 | 29.678 | 161.679 |
| 1.304000000000003 | 5.476 | 29.989 | 164.227 |
| 1.306000000000003 | 5.505 | 30.304 | 166.819 |
| 1.308000000000003 | 5.534 | 30.622 | 169.456 |
| 1.310000000000003 | 5.563 | 30.945 | 172.139 |
| 1.312000000000003 | 5.592 | 31.271 | 174.868 |
| 1.314000000000003 | 5.621 | 31.601 | 177.645 |
| 1.316000000000003 | 5.651 | 31.935 | 180.471 |
| 1.318000000000003 | 5.681 | 32.274 | 183.345 |
| 1.320000000000003 | 5.711 | 32.616 | 186.271 |
| 1.322000000000003 | 5.741 | 32.962 | 189.247 |
| 1.324000000000003 | 5.772 | 33.313 | 192.275 |
| 1.326000000000003 | 5.802 | 33.668 | 195.357 |
| 1.328000000000003 | 5.833 | 34.027 | 198.493 |
| 1.330000000000003 | 5.864 | 34.391 | 201.684 |
| 1.332000000000003 | 5.896 | 34.759 | 204.931 |
| 1.334000000000003 | 5.927 | 35.132 | 208.235 |
| 1.336000000000003 | 5.959 | 35.509 | 211.598 |
| 1.338000000000003 | 5.991 | 35.891 | 215.02 |
| 1.340000000000003 | 6.023 | 36.278 | 218.503 |
| 1.342000000000003 | 6.055 | 36.669 | 222.048 |
| 1.344000000000003 | 6.088 | 37.065 | 225.655 |
| 1.346000000000003 | 6.121 | 37.466 | 229.327 |
| 1.348000000000003 | 6.154 | 37.872 | 233.064 |
| 1.350000000000003 | 6.187 | 38.283 | 236.867 |
| 1.352000000000003 | 6.221 | 38.699 | 240.739 |
| 1.354000000000003 | 6.255 | 39.12 | 244.679 |
| 1.356000000000003 | 6.289 | 39.546 | 248.69 |
| 1.358000000000003 | 6.323 | 39.978 | 252.773 |
| 1.360000000000003 | 6.357 | 40.415 | 256.929 |
| 1.362000000000003 | 6.392 | 40.857 | 261.16 |
| 1.364000000000003 | 6.427 | 41.305 | 265.466 |
| 1.366000000000003 | 6.462 | 41.759 | 269.85 |
| 1.368000000000003 | 6.498 | 42.218 | 274.314 |
| 1.370000000000003 | 6.533 | 42.683 | 278.857 |
| 1.372000000000003 | 6.569 | 43.154 | 283.483 |
| 1.374000000000003 | 6.605 | 43.63 | 288.192 |
| 1.376000000000003 | 6.642 | 44.113 | 292.987 |
| 1.378000000000003 | 6.678 | 44.602 | 297.868 |
| 1.380000000000003 | 6.715 | 45.096 | 302.839 |
| 1.382000000000003 | 6.753 | 45.597 | 307.899 |
| 1.384000000000003 | 6.79 | 46.105 | 313.052 |
| 1.386000000000003 | 6.828 | 46.618 | 318.298 |
| 1.388000000000003 | 6.866 | 47.138 | 323.64 |
| 1.390000000000003 | 6.904 | 47.665 | 329.08 |
| 1.392000000000003 | 6.943 | 48.199 | 334.619 |
| 1.394000000000003 | 6.981 | 48.739 | 340.259 |
| 1.396000000000003 | 7.02 | 49.286 | 346.003 |
| 1.398000000000003 | 7.06 | 49.84 | 351.852 |
| 1.400000000000003 | 7.099 | 50.4 | 357.809 |
| 1.402000000000003 | 7.139 | 50.969 | 363.876 |
| 1.404000000000003 | 7.179 | 51.544 | 370.054 |
| 1.406000000000003 | 7.22 | 52.126 | 376.346 |
| 1.408000000000003 | 7.261 | 52.716 | 382.754 |
| 1.410000000000003 | 7.302 | 53.314 | 389.28 |
| 1.412000000000003 | 7.343 | 53.919 | 395.928 |
| 1.414000000000003 | 7.385 | 54.532 | 402.698 |
| 1.416000000000003 | 7.427 | 55.153 | 409.595 |
| 1.418000000000003 | 7.469 | 55.782 | 416.619 |
| 1.420000000000003 | 7.511 | 56.419 | 423.774 |
| 1.422000000000003 | 7.554 | 57.064 | 431.062 |
| 1.424000000000003 | 7.597 | 57.717 | 438.486 |
| 1.426000000000003 | 7.641 | 58.379 | 446.049 |
| 1.428000000000003 | 7.684 | 59.049 | 453.753 |
| 1.430000000000003 | 7.728 | 59.728 | 461.601 |
| 1.432000000000003 | 7.773 | 60.416 | 469.596 |
| 1.434000000000003 | 7.817 | 61.112 | 477.741 |
| 1.436000000000003 | 7.862 | 61.818 | 486.039 |
| 1.438000000000003 | 7.908 | 62.533 | 494.493 |
| 1.440000000000003 | 7.953 | 63.257 | 503.106 |
| 1.442000000000003 | 7.999 | 63.99 | 511.881 |
| 1.444000000000003 | 8.046 | 64.733 | 520.822 |
| 1.446000000000003 | 8.092 | 65.486 | 529.932 |
| 1.448000000000003 | 8.139 | 66.248 | 539.214 |
| 1.450000000000003 | 8.187 | 67.021 | 548.672 |
| 1.452000000000003 | 8.234 | 67.803 | 558.309 |
| 1.454000000000003 | 8.282 | 68.596 | 568.129 |
| 1.456000000000003 | 8.331 | 69.399 | 578.135 |
| 1.458000000000003 | 8.379 | 70.213 | 588.332 |
| 1.460000000000003 | 8.428 | 71.037 | 598.724 |
| 1.462000000000003 | 8.478 | 71.872 | 609.313 |
| 1.464000000000003 | 8.527 | 72.718 | 620.104 |
| 1.466000000000003 | 8.578 | 73.575 | 631.102 |
| 1.468000000000003 | 8.628 | 74.444 | 642.311 |
| 1.470000000000003 | 8.679 | 75.324 | 653.734 |
| 1.472000000000003 | 8.73 | 76.216 | 665.376 |
| 1.474000000000003 | 8.782 | 77.119 | 677.242 |
| 1.476000000000003 | 8.834 | 78.035 | 689.335 |
| 1.478000000000003 | 8.886 | 78.962 | 701.662 |
| 1.480000000000003 | 8.939 | 79.902 | 714.226 |
| 1.482000000000003 | 8.992 | 80.854 | 727.033 |
| 1.484000000000003 | 9.045 | 81.819 | 740.087 |
| 1.486000000000003 | 9.099 | 82.797 | 753.394 |
| 1.488000000000003 | 9.154 | 83.788 | 766.958 |
| 1.490000000000003 | 9.208 | 84.792 | 780.785 |
| 1.492000000000003 | 9.263 | 85.809 | 794.881 |
| 1.494000000000003 | 9.319 | 86.84 | 809.25 |
| 1.496000000000003 | 9.375 | 87.885 | 823.899 |
| 1.498000000000003 | 9.431 | 88.944 | 838.833 |
| 1.500000000000003 | 9.488 | 90.017 | 854.059 |
| 1.502000000000003 | 9.545 | 91.105 | 869.581 |
| 1.504000000000003 | 9.602 | 92.207 | 885.408 |
| 1.506000000000003 | 9.66 | 93.324 | 901.543 |
| 1.508000000000003 | 9.719 | 94.455 | 917.995 |
| 1.510000000000003 | 9.778 | 95.603 | 934.77 |
| 1.512000000000003 | 9.837 | 96.765 | 951.873 |
| 1.514000000000003 | 9.897 | 97.944 | 969.313 |
| 1.516000000000003 | 9.957 | 99.138 | 987.097 |
| 1.518000000000003 | 10.017 | 100.348 | 1005.23 |
| 1.520000000000003 | 10.078 | 101.575 | 1023.722 |
| 1.522000000000003 | 10.14 | 102.819 | 1042.578 |
| 1.524000000000003 | 10.202 | 104.079 | 1061.808 |
| 1.526000000000003 | 10.264 | 105.357 | 1081.418 |
| 1.528000000000003 | 10.327 | 106.652 | 1101.416 |
| 1.530000000000003 | 10.391 | 107.964 | 1121.811 |
| 1.532000000000003 | 10.454 | 109.295 | 1142.612 |
| 1.534000000000003 | 10.519 | 110.643 | 1163.826 |
| 1.536000000000003 | 10.583 | 112.01 | 1185.462 |
| 1.538000000000003 | 10.649 | 113.396 | 1207.53 |
| 1.540000000000003 | 10.715 | 114.801 | 1230.038 |
| 1.542000000000003 | 10.781 | 116.225 | 1252.995 |
| 1.544000000000003 | 10.848 | 117.669 | 1276.412 |
| 1.546000000000003 | 10.915 | 119.132 | 1300.297 |
| 1.548000000000003 | 10.983 | 120.616 | 1324.661 |
| 1.550000000000003 | 11.051 | 122.119 | 1349.514 |
| 1.552000000000003 | 11.12 | 123.644 | 1374.867 |
| 1.554000000000003 | 11.189 | 125.19 | 1400.729 |
| 1.556000000000003 | 11.259 | 126.757 | 1427.112 |
| 1.558000000000003 | 11.329 | 128.346 | 1454.027 |
| 1.560000000000003 | 11.4 | 129.957 | 1481.485 |
| 1.562000000000003 | 11.471 | 131.59 | 1509.497 |
| 1.564000000000003 | 11.543 | 133.245 | 1538.077 |
| 1.566000000000003 | 11.616 | 134.924 | 1567.235 |
| 1.568000000000003 | 11.689 | 136.626 | 1596.984 |
| 1.570000000000003 | 11.762 | 138.352 | 1627.337 |
| 1.572000000000003 | 11.836 | 140.102 | 1658.306 |
| 1.574000000000003 | 11.911 | 141.876 | 1689.906 |
| 1.576000000000003 | 11.986 | 143.675 | 1722.149 |
| 1.578000000000003 | 12.062 | 145.499 | 1755.049 |
| 1.580000000000003 | 12.139 | 147.348 | 1788.621 |
| 1.582000000000003 | 12.216 | 149.224 | 1822.878 |
| 1.584000000000003 | 12.293 | 151.126 | 1857.837 |
| 1.586000000000003 | 12.372 | 153.054 | 1893.511 |
| 1.588000000000003 | 12.45 | 155.01 | 1929.916 |
| 1.590000000000003 | 12.53 | 156.993 | 1967.069 |
| 1.592000000000003 | 12.61 | 159.004 | 2004.985 |
| 1.594000000000003 | 12.69 | 161.043 | 2043.681 |
| 1.596000000000003 | 12.771 | 163.111 | 2083.174 |
| 1.598000000000003 | 12.853 | 165.208 | 2123.481 |
| 1.600000000000003 | 12.936 | 167.335 | 2164.62 |
| 1.602000000000003 | 13.019 | 169.492 | 2206.608 |
| 1.604000000000003 | 13.103 | 171.68 | 2249.466 |
| 1.606000000000003 | 13.187 | 173.899 | 2293.21 |
| 1.608000000000003 | 13.272 | 176.149 | 2337.862 |
| 1.610000000000003 | 13.358 | 178.431 | 2383.44 |
| 1.612000000000003 | 13.444 | 180.745 | 2429.965 |
| 1.614000000000003 | 13.531 | 183.093 | 2477.457 |
| 1.616000000000003 | 13.619 | 185.473 | 2525.939 |
| 1.618000000000003 | 13.707 | 187.888 | 2575.431 |
| 1.620000000000003 | 13.796 | 190.338 | 2625.955 |
| 1.622000000000003 | 13.886 | 192.822 | 2677.535 |
| 1.624000000000003 | 13.976 | 195.342 | 2730.194 |
| 1.626000000000003 | 14.068 | 197.898 | 2783.955 |
| 1.628000000000003 | 14.159 | 200.491 | 2838.843 |
| 1.630000000000003 | 14.252 | 203.121 | 2894.883 |
| 1.632000000000003 | 14.345 | 205.788 | 2952.1 |
| 1.634000000000003 | 14.439 | 208.494 | 3010.52 |
| 1.636000000000003 | 14.534 | 211.239 | 3070.169 |
| 1.638000000000003 | 14.63 | 214.024 | 3131.076 |
| 1.640000000000003 | 14.726 | 216.849 | 3193.268 |
| 1.642000000000003 | 14.823 | 219.714 | 3256.773 |
| 1.644000000000003 | 14.92 | 222.621 | 3321.62 |
| 1.646000000000003 | 15.019 | 225.57 | 3387.841 |
| 1.648000000000003 | 15.118 | 228.562 | 3455.464 |
| 1.650000000000003 | 15.218 | 231.597 | 3524.522 |
| 1.652000000000003 | 15.319 | 234.677 | 3595.046 |
| 1.654000000000003 | 15.421 | 237.8 | 3667.069 |
| 1.656000000000003 | 15.523 | 240.97 | 3740.625 |
| 1.658000000000003 | 15.626 | 244.185 | 3815.748 |
| 1.660000000000003 | 15.73 | 247.448 | 3892.473 |
| 1.662000000000003 | 15.835 | 250.758 | 3970.836 |
| 1.664000000000003 | 15.941 | 254.116 | 4050.874 |
| 1.666000000000003 | 16.048 | 257.524 | 4132.625 |
| 1.668000000000003 | 16.155 | 260.981 | 4216.126 |
| 1.670000000000003 | 16.263 | 264.489 | 4301.418 |
| 1.672000000000003 | 16.372 | 268.049 | 4388.541 |
| 1.674000000000003 | 16.482 | 271.66 | 4477.535 |
| 1.676000000000003 | 16.593 | 275.325 | 4568.444 |
| 1.678000000000003 | 16.705 | 279.044 | 4661.311 |
| 1.680000000000003 | 16.817 | 282.817 | 4756.18 |
| 1.682000000000003 | 16.931 | 286.646 | 4853.095 |
| 1.684000000000003 | 17.045 | 290.531 | 4952.105 |
| 1.686000000000003 | 17.16 | 294.474 | 5053.256 |
| 1.688000000000003 | 17.276 | 298.476 | 5156.596 |
| 1.690000000000003 | 17.394 | 302.536 | 5262.176 |
| 1.692000000000003 | 17.512 | 306.656 | 5370.047 |
| 1.694000000000003 | 17.631 | 310.838 | 5480.261 |
| 1.696000000000003 | 17.751 | 315.082 | 5592.871 |
| 1.698000000000003 | 17.871 | 319.388 | 5707.932 |
| 1.700000000000003 | 17.993 | 323.759 | 5825.499 |
| 1.702000000000003 | 18.116 | 328.195 | 5945.631 |
| 1.704000000000003 | 18.24 | 332.697 | 6068.386 |
| 1.706000000000003 | 18.365 | 337.266 | 6193.824 |
| 1.708000000000003 | 18.491 | 341.903 | 6322.007 |
| 1.710000000000003 | 18.617 | 346.61 | 6452.997 |
| 1.712000000000003 | 18.745 | 351.387 | 6586.86 |
| 1.714000000000003 | 18.874 | 356.235 | 6723.66 |
| 1.716000000000003 | 19.004 | 361.157 | 6863.467 |
| 1.718000000000003 | 19.135 | 366.152 | 7006.349 |
| 1.720000000000003 | 19.267 | 371.222 | 7152.377 |
| 1.722000000000003 | 19.4 | 376.368 | 7301.624 |
| 1.724000000000003 | 19.534 | 381.592 | 7454.163 |
| 1.726000000000003 | 19.67 | 386.894 | 7610.073 |
| 1.728000000000003 | 19.806 | 392.277 | 7769.429 |
| 1.730000000000003 | 19.943 | 397.741 | 7932.313 |
| 1.732000000000003 | 20.082 | 403.287 | 8098.807 |
| 1.734000000000003 | 20.222 | 408.917 | 8268.993 |
| 1.736000000000003 | 20.363 | 414.632 | 8442.958 |
| 1.738000000000003 | 20.504 | 420.434 | 8620.79 |
| 1.740000000000003 | 20.648 | 426.324 | 8802.579 |
| 1.742000000000003 | 20.792 | 432.304 | 8988.417 |
| 1.744000000000003 | 20.937 | 438.374 | 9178.398 |
| 1.746000000000003 | 21.084 | 444.536 | 9372.62 |
| 1.748000000000003 | 21.232 | 450.793 | 9571.182 |
| 1.750000000000003 | 21.381 | 457.145 | 9774.185 |
| 1.752000000000003 | 21.531 | 463.593 | 9981.733 |
| 1.754000000000003 | 21.683 | 470.141 | 10193.933 |
| 1.756000000000003 | 21.835 | 476.788 | 10410.894 |
| 1.758000000000003 | 21.989 | 483.537 | 10632.727 |
| 1.760000000000003 | 22.145 | 490.39 | 10859.548 |
| 1.762000000000003 | 22.301 | 497.347 | 11091.474 |
| 1.764000000000003 | 22.459 | 504.411 | 11328.625 |
| 1.766000000000003 | 22.618 | 511.584 | 11571.124 |
| 1.768000000000003 | 22.779 | 518.867 | 11819.098 |
| 1.770000000000003 | 22.94 | 526.262 | 12072.676 |
| 1.772000000000003 | 23.103 | 533.772 | 12331.99 |
| 1.774000000000003 | 23.268 | 541.397 | 12597.177 |
| 1.776000000000003 | 23.434 | 549.139 | 12868.375 |
| 1.778000000000003 | 23.601 | 557.002 | 13145.726 |
| 1.780000000000003 | 23.769 | 564.985 | 13429.378 |
| 1.782000000000003 | 23.939 | 573.093 | 13719.48 |
| 1.784000000000003 | 24.111 | 581.326 | 14016.185 |
| 1.786000000000003 | 24.283 | 589.687 | 14319.65 |
| 1.788000000000003 | 24.458 | 598.178 | 14630.037 |
| 1.790000000000003 | 24.633 | 606.8 | 14947.51 |
| 1.792000000000003 | 24.81 | 615.557 | 15272.239 |
| 1.794000000000003 | 24.989 | 624.45 | 15604.397 |
| 1.796000000000003 | 25.169 | 633.482 | 15944.162 |
| 1.798000000000003 | 25.351 | 642.655 | 16291.715 |
| 1.800000000000003 | 25.534 | 651.971 | 16647.245 |
| 1.802000000000003 | 25.718 | 661.433 | 17010.941 |
| 1.804000000000003 | 25.904 | 671.042 | 17383 |
| 1.806000000000003 | 26.092 | 680.802 | 17763.623 |
| 1.808000000000003 | 26.281 | 690.715 | 18153.016 |
| 1.810000000000003 | 26.472 | 700.784 | 18551.39 |
| 1.812000000000003 | 26.665 | 711.011 | 18958.961 |
| 1.814000000000003 | 26.859 | 721.399 | 19375.952 |
| 1.816000000000003 | 27.055 | 731.95 | 19802.59 |
| 1.818000000000003 | 27.252 | 742.667 | 20239.107 |
| 1.820000000000003 | 27.451 | 753.553 | 20685.743 |
| 1.822000000000003 | 27.652 | 764.612 | 21142.743 |
| 1.824000000000003 | 27.854 | 775.844 | 21610.358 |
| 1.826000000000003 | 28.058 | 787.255 | 22088.845 |
| 1.828000000000003 | 28.264 | 798.846 | 22578.468 |
| 1.830000000000003 | 28.471 | 810.62 | 23079.499 |
| 1.832000000000003 | 28.681 | 822.582 | 23592.213 |
| 1.834000000000003 | 28.892 | 834.733 | 24116.897 |
| 1.836000000000003 | 29.105 | 847.077 | 24653.841 |
| 1.838000000000003 | 29.319 | 859.618 | 25203.345 |
| 1.840000000000003 | 29.536 | 872.358 | 25765.715 |
| 1.842000000000003 | 29.754 | 885.301 | 26341.265 |
| 1.844000000000003 | 29.974 | 898.451 | 26930.318 |
| 1.846000000000003 | 30.196 | 911.81 | 27533.205 |
| 1.848000000000003 | 30.42 | 925.383 | 28150.264 |
| 1.850000000000003 | 30.646 | 939.173 | 28781.843 |
| 1.852000000000003 | 30.874 | 953.184 | 29428.298 |
| 1.854000000000003 | 31.103 | 967.419 | 30089.995 |
| 1.856000000000003 | 31.335 | 981.883 | 30767.309 |
| 1.858000000000003 | 31.569 | 996.579 | 31460.624 |
| 1.860000000000003 | 31.804 | 1011.51 | 32170.334 |
| 1.862000000000003 | 32.042 | 1026.682 | 32896.844 |
| 1.864000000000003 | 32.282 | 1042.099 | 33640.568 |
| 1.866000000000003 | 32.523 | 1057.763 | 34401.932 |
| 1.868000000000003 | 32.767 | 1073.681 | 35181.371 |
| 1.870000000000003 | 33.013 | 1089.855 | 35979.334 |
| 1.872000000000003 | 33.261 | 1106.291 | 36796.279 |
| 1.874000000000003 | 33.511 | 1122.992 | 37632.676 |
| 1.876000000000003 | 33.763 | 1139.964 | 38489.009 |
| 1.878000000000003 | 34.018 | 1157.211 | 39365.773 |
| 1.880000000000003 | 34.274 | 1174.738 | 40263.475 |
| 1.882000000000003 | 34.533 | 1192.549 | 41182.636 |
| 1.884000000000003 | 34.794 | 1210.649 | 42123.792 |
| 1.886000000000003 | 35.058 | 1229.044 | 43087.491 |
| 1.888000000000003 | 35.323 | 1247.739 | 44074.294 |
| 1.890000000000003 | 35.591 | 1266.738 | 45084.78 |
| 1.892000000000003 | 35.861 | 1286.046 | 46119.54 |
| 1.894000000000003 | 36.134 | 1305.671 | 47179.181 |
| 1.896000000000003 | 36.409 | 1325.615 | 48264.327 |
| 1.898000000000003 | 36.686 | 1345.886 | 49375.617 |
| 1.900000000000003 | 36.966 | 1366.489 | 50513.707 |
| 1.902000000000003 | 37.248 | 1387.429 | 51679.269 |
| 1.904000000000003 | 37.533 | 1408.713 | 52872.995 |
| 1.906000000000003 | 37.82 | 1430.346 | 54095.593 |
| 1.908000000000003 | 38.11 | 1452.335 | 55347.789 |
| 1.910000000000003 | 38.402 | 1474.685 | 56630.331 |
| 1.912000000000003 | 38.696 | 1497.404 | 57943.982 |
| 1.914000000000003 | 38.994 | 1520.496 | 59289.529 |
| 1.916000000000003 | 39.293 | 1543.97 | 60667.778 |
| 1.918000000000003 | 39.596 | 1567.83 | 62079.556 |
| 1.920000000000003 | 39.901 | 1592.085 | 63525.711 |
| 1.922000000000003 | 40.209 | 1616.742 | 65007.115 |
| 1.924000000000003 | 40.519 | 1641.806 | 66524.661 |
| 1.926000000000003 | 40.832 | 1667.285 | 68079.267 |
| 1.928000000000003 | 41.148 | 1693.187 | 69671.875 |
| 1.930000000000003 | 41.467 | 1719.519 | 71303.451 |
| 1.932000000000003 | 41.789 | 1746.289 | 72974.986 |
| 1.934000000000003 | 42.113 | 1773.503 | 74687.498 |
| 1.936000000000003 | 42.44 | 1801.17 | 76442.033 |
| 1.938000000000003 | 42.77 | 1829.299 | 78239.663 |
| 1.940000000000003 | 43.103 | 1857.896 | 80081.488 |
| 1.942000000000003 | 43.439 | 1886.971 | 81968.639 |
| 1.944000000000003 | 43.778 | 1916.531 | 83902.274 |
| 1.946000000000003 | 44.12 | 1946.585 | 85883.585 |
| 1.948000000000003 | 44.465 | 1977.143 | 87913.794 |
| 1.950000000000003 | 44.813 | 2008.212 | 89994.155 |
| 1.952000000000003 | 45.164 | 2039.802 | 92125.955 |
| 1.954000000000003 | 45.518 | 2071.922 | 94310.518 |
| 1.956000000000003 | 45.876 | 2104.582 | 96549.2 |
| 1.958000000000003 | 46.236 | 2137.79 | 98843.394 |
| 1.960000000000003 | 46.6 | 2171.558 | 101194.532 |
| 1.962000000000003 | 46.967 | 2205.894 | 103604.081 |
| 1.964000000000003 | 47.337 | 2240.808 | 106073.55 |
| 1.966000000000003 | 47.711 | 2276.312 | 108604.487 |
| 1.968000000000003 | 48.088 | 2312.416 | 111198.481 |
| 1.970000000000003 | 48.468 | 2349.129 | 113857.165 |
| 1.972000000000003 | 48.851 | 2386.464 | 116582.214 |
| 1.974000000000003 | 49.239 | 2424.431 | 119375.349 |
| 1.976000000000003 | 49.629 | 2463.041 | 122238.337 |
| 1.978000000000003 | 50.023 | 2502.306 | 125172.993 |
| 1.980000000000003 | 50.421 | 2542.238 | 128181.179 |
| 1.982000000000003 | 50.822 | 2582.848 | 131264.808 |
| 1.984000000000003 | 51.226 | 2624.149 | 134425.847 |
| 1.986000000000003 | 51.635 | 2666.153 | 137666.311 |
| 1.988000000000003 | 52.047 | 2708.873 | 140988.274 |
| 1.990000000000003 | 52.463 | 2752.321 | 144393.862 |
| 1.992000000000003 | 52.882 | 2796.511 | 147885.263 |
| 1.994000000000003 | 53.305 | 2841.456 | 151464.719 |
| 1.996000000000003 | 53.732 | 2887.17 | 155134.537 |
| 1.998000000000003 | 54.163 | 2933.666 | 158897.084 |
| 2.000000000000003 | 54.598 | 2980.958 | 162754.791 |